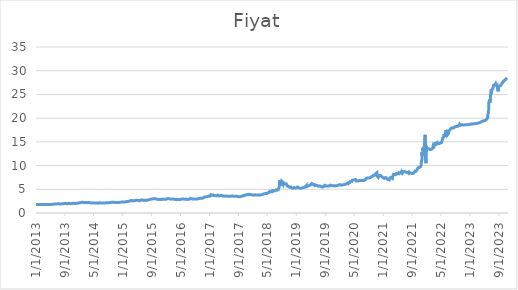
| Category | Fiyat |
|---|---|
| 1/1/13 | 1.784 |
| 1/2/13 | 1.784 |
| 1/3/13 | 1.779 |
| 1/4/13 | 1.785 |
| 1/7/13 | 1.783 |
| 1/8/13 | 1.78 |
| 1/9/13 | 1.78 |
| 1/10/13 | 1.775 |
| 1/11/13 | 1.766 |
| 1/14/13 | 1.771 |
| 1/15/13 | 1.769 |
| 1/16/13 | 1.77 |
| 1/17/13 | 1.765 |
| 1/18/13 | 1.752 |
| 1/21/13 | 1.763 |
| 1/22/13 | 1.764 |
| 1/23/13 | 1.769 |
| 1/24/13 | 1.772 |
| 1/25/13 | 1.769 |
| 1/28/13 | 1.765 |
| 1/29/13 | 1.774 |
| 1/30/13 | 1.768 |
| 1/31/13 | 1.768 |
| 2/1/13 | 1.759 |
| 2/4/13 | 1.749 |
| 2/5/13 | 1.761 |
| 2/6/13 | 1.76 |
| 2/7/13 | 1.769 |
| 2/8/13 | 1.775 |
| 2/11/13 | 1.771 |
| 2/12/13 | 1.776 |
| 2/13/13 | 1.772 |
| 2/14/13 | 1.762 |
| 2/15/13 | 1.768 |
| 2/18/13 | 1.766 |
| 2/19/13 | 1.767 |
| 2/20/13 | 1.777 |
| 2/21/13 | 1.784 |
| 2/22/13 | 1.793 |
| 2/25/13 | 1.8 |
| 2/26/13 | 1.809 |
| 2/27/13 | 1.805 |
| 2/28/13 | 1.796 |
| 3/1/13 | 1.798 |
| 3/4/13 | 1.799 |
| 3/5/13 | 1.799 |
| 3/6/13 | 1.792 |
| 3/7/13 | 1.798 |
| 3/8/13 | 1.797 |
| 3/11/13 | 1.808 |
| 3/12/13 | 1.799 |
| 3/13/13 | 1.803 |
| 3/14/13 | 1.813 |
| 3/15/13 | 1.81 |
| 3/18/13 | 1.808 |
| 3/19/13 | 1.813 |
| 3/20/13 | 1.828 |
| 3/21/13 | 1.818 |
| 3/22/13 | 1.816 |
| 3/25/13 | 1.811 |
| 3/26/13 | 1.824 |
| 3/27/13 | 1.815 |
| 3/28/13 | 1.813 |
| 3/29/13 | 1.811 |
| 4/1/13 | 1.81 |
| 4/2/13 | 1.806 |
| 4/3/13 | 1.805 |
| 4/4/13 | 1.809 |
| 4/5/13 | 1.803 |
| 4/8/13 | 1.796 |
| 4/9/13 | 1.785 |
| 4/10/13 | 1.785 |
| 4/11/13 | 1.79 |
| 4/12/13 | 1.784 |
| 4/15/13 | 1.789 |
| 4/16/13 | 1.792 |
| 4/17/13 | 1.788 |
| 4/18/13 | 1.801 |
| 4/19/13 | 1.798 |
| 4/22/13 | 1.802 |
| 4/23/13 | 1.804 |
| 4/24/13 | 1.805 |
| 4/25/13 | 1.803 |
| 4/26/13 | 1.798 |
| 4/29/13 | 1.798 |
| 4/30/13 | 1.796 |
| 5/1/13 | 1.794 |
| 5/2/13 | 1.793 |
| 5/3/13 | 1.792 |
| 5/6/13 | 1.798 |
| 5/7/13 | 1.796 |
| 5/8/13 | 1.796 |
| 5/9/13 | 1.792 |
| 5/10/13 | 1.799 |
| 5/13/13 | 1.801 |
| 5/14/13 | 1.813 |
| 5/15/13 | 1.817 |
| 5/16/13 | 1.823 |
| 5/17/13 | 1.823 |
| 5/20/13 | 1.843 |
| 5/21/13 | 1.841 |
| 5/22/13 | 1.843 |
| 5/23/13 | 1.848 |
| 5/24/13 | 1.845 |
| 5/27/13 | 1.85 |
| 5/28/13 | 1.846 |
| 5/29/13 | 1.86 |
| 5/30/13 | 1.86 |
| 5/31/13 | 1.872 |
| 6/3/13 | 1.879 |
| 6/4/13 | 1.885 |
| 6/5/13 | 1.878 |
| 6/6/13 | 1.892 |
| 6/7/13 | 1.894 |
| 6/10/13 | 1.877 |
| 6/11/13 | 1.902 |
| 6/12/13 | 1.892 |
| 6/13/13 | 1.875 |
| 6/14/13 | 1.862 |
| 6/17/13 | 1.858 |
| 6/18/13 | 1.873 |
| 6/19/13 | 1.886 |
| 6/20/13 | 1.903 |
| 6/21/13 | 1.938 |
| 6/24/13 | 1.938 |
| 6/25/13 | 1.944 |
| 6/26/13 | 1.931 |
| 6/27/13 | 1.935 |
| 6/28/13 | 1.922 |
| 7/1/13 | 1.93 |
| 7/2/13 | 1.923 |
| 7/3/13 | 1.934 |
| 7/4/13 | 1.946 |
| 7/5/13 | 1.942 |
| 7/8/13 | 1.968 |
| 7/9/13 | 1.946 |
| 7/10/13 | 1.94 |
| 7/11/13 | 1.95 |
| 7/12/13 | 1.951 |
| 7/15/13 | 1.956 |
| 7/16/13 | 1.934 |
| 7/17/13 | 1.92 |
| 7/18/13 | 1.91 |
| 7/19/13 | 1.921 |
| 7/22/13 | 1.919 |
| 7/23/13 | 1.913 |
| 7/24/13 | 1.9 |
| 7/25/13 | 1.92 |
| 7/26/13 | 1.922 |
| 7/29/13 | 1.927 |
| 7/30/13 | 1.926 |
| 7/31/13 | 1.923 |
| 8/1/13 | 1.934 |
| 8/2/13 | 1.946 |
| 8/5/13 | 1.924 |
| 8/6/13 | 1.93 |
| 8/7/13 | 1.924 |
| 8/8/13 | 1.932 |
| 8/9/13 | 1.922 |
| 8/12/13 | 1.922 |
| 8/13/13 | 1.925 |
| 8/14/13 | 1.934 |
| 8/15/13 | 1.937 |
| 8/16/13 | 1.934 |
| 8/19/13 | 1.945 |
| 8/20/13 | 1.954 |
| 8/21/13 | 1.95 |
| 8/22/13 | 1.978 |
| 8/23/13 | 1.994 |
| 8/26/13 | 1.988 |
| 8/27/13 | 1.999 |
| 8/28/13 | 2.037 |
| 8/29/13 | 2.04 |
| 8/30/13 | 2.037 |
| 9/2/13 | 2.036 |
| 9/3/13 | 2.023 |
| 9/4/13 | 2.06 |
| 9/5/13 | 2.05 |
| 9/6/13 | 2.07 |
| 9/9/13 | 2.046 |
| 9/10/13 | 2.026 |
| 9/11/13 | 2.014 |
| 9/12/13 | 2.012 |
| 9/13/13 | 2.031 |
| 9/16/13 | 2.028 |
| 9/17/13 | 2.006 |
| 9/18/13 | 2.002 |
| 9/19/13 | 1.951 |
| 9/20/13 | 1.962 |
| 9/23/13 | 1.978 |
| 9/24/13 | 1.985 |
| 9/25/13 | 1.997 |
| 9/26/13 | 2.018 |
| 9/27/13 | 2.023 |
| 9/30/13 | 2.042 |
| 10/1/13 | 2.02 |
| 10/2/13 | 2.008 |
| 10/3/13 | 1.995 |
| 10/4/13 | 2.003 |
| 10/7/13 | 1.988 |
| 10/8/13 | 1.994 |
| 10/9/13 | 1.991 |
| 10/10/13 | 1.983 |
| 10/11/13 | 1.977 |
| 10/14/13 | 1.984 |
| 10/15/13 | 1.983 |
| 10/16/13 | 1.988 |
| 10/17/13 | 1.974 |
| 10/18/13 | 1.967 |
| 10/21/13 | 1.968 |
| 10/22/13 | 1.982 |
| 10/23/13 | 1.968 |
| 10/24/13 | 1.974 |
| 10/25/13 | 1.98 |
| 10/28/13 | 1.984 |
| 10/29/13 | 1.985 |
| 10/30/13 | 1.993 |
| 10/31/13 | 1.994 |
| 11/1/13 | 1.997 |
| 11/4/13 | 2.014 |
| 11/5/13 | 2.018 |
| 11/6/13 | 2.032 |
| 11/7/13 | 2.036 |
| 11/8/13 | 2.034 |
| 11/11/13 | 2.039 |
| 11/12/13 | 2.045 |
| 11/13/13 | 2.055 |
| 11/14/13 | 2.044 |
| 11/15/13 | 2.033 |
| 11/18/13 | 2.032 |
| 11/19/13 | 2.022 |
| 11/20/13 | 2.011 |
| 11/21/13 | 2.015 |
| 11/22/13 | 2.017 |
| 11/25/13 | 2.005 |
| 11/26/13 | 2.01 |
| 11/27/13 | 2.014 |
| 11/28/13 | 2.028 |
| 11/29/13 | 2.015 |
| 12/2/13 | 2.021 |
| 12/3/13 | 2.04 |
| 12/4/13 | 2.044 |
| 12/5/13 | 2.049 |
| 12/6/13 | 2.039 |
| 12/9/13 | 2.025 |
| 12/10/13 | 2.032 |
| 12/11/13 | 2.03 |
| 12/12/13 | 2.043 |
| 12/13/13 | 2.044 |
| 12/16/13 | 2.043 |
| 12/17/13 | 2.028 |
| 12/18/13 | 2.038 |
| 12/19/13 | 2.059 |
| 12/20/13 | 2.074 |
| 12/23/13 | 2.09 |
| 12/24/13 | 2.099 |
| 12/25/13 | 2.079 |
| 12/26/13 | 2.096 |
| 12/27/13 | 2.129 |
| 12/30/13 | 2.15 |
| 12/31/13 | 2.124 |
| 1/1/14 | 2.145 |
| 1/2/14 | 2.148 |
| 1/3/14 | 2.171 |
| 1/6/14 | 2.176 |
| 1/7/14 | 2.173 |
| 1/8/14 | 2.169 |
| 1/9/14 | 2.186 |
| 1/10/14 | 2.178 |
| 1/13/14 | 2.164 |
| 1/14/14 | 2.179 |
| 1/15/14 | 2.186 |
| 1/16/14 | 2.192 |
| 1/17/14 | 2.21 |
| 1/20/14 | 2.233 |
| 1/21/14 | 2.241 |
| 1/22/14 | 2.252 |
| 1/23/14 | 2.259 |
| 1/24/14 | 2.293 |
| 1/27/14 | 2.333 |
| 1/28/14 | 2.285 |
| 1/29/14 | 2.25 |
| 1/30/14 | 2.262 |
| 1/31/14 | 2.266 |
| 2/3/14 | 2.254 |
| 2/4/14 | 2.283 |
| 2/5/14 | 2.237 |
| 2/6/14 | 2.238 |
| 2/7/14 | 2.213 |
| 2/10/14 | 2.225 |
| 2/11/14 | 2.217 |
| 2/12/14 | 2.193 |
| 2/13/14 | 2.193 |
| 2/14/14 | 2.184 |
| 2/17/14 | 2.184 |
| 2/18/14 | 2.181 |
| 2/19/14 | 2.181 |
| 2/20/14 | 2.214 |
| 2/21/14 | 2.203 |
| 2/24/14 | 2.181 |
| 2/25/14 | 2.206 |
| 2/26/14 | 2.213 |
| 2/27/14 | 2.226 |
| 2/28/14 | 2.213 |
| 3/3/14 | 2.202 |
| 3/4/14 | 2.232 |
| 3/5/14 | 2.206 |
| 3/6/14 | 2.204 |
| 3/7/14 | 2.18 |
| 3/10/14 | 2.204 |
| 3/11/14 | 2.219 |
| 3/12/14 | 2.252 |
| 3/13/14 | 2.233 |
| 3/14/14 | 2.234 |
| 3/17/14 | 2.22 |
| 3/18/14 | 2.224 |
| 3/19/14 | 2.219 |
| 3/20/14 | 2.242 |
| 3/21/14 | 2.23 |
| 3/24/14 | 2.237 |
| 3/25/14 | 2.242 |
| 3/26/14 | 2.222 |
| 3/27/14 | 2.195 |
| 3/28/14 | 2.188 |
| 3/31/14 | 2.189 |
| 4/1/14 | 2.14 |
| 4/2/14 | 2.139 |
| 4/3/14 | 2.131 |
| 4/4/14 | 2.134 |
| 4/7/14 | 2.114 |
| 4/8/14 | 2.11 |
| 4/9/14 | 2.097 |
| 4/10/14 | 2.103 |
| 4/11/14 | 2.109 |
| 4/14/14 | 2.12 |
| 4/15/14 | 2.117 |
| 4/16/14 | 2.146 |
| 4/17/14 | 2.137 |
| 4/18/14 | 2.129 |
| 4/21/14 | 2.13 |
| 4/22/14 | 2.134 |
| 4/23/14 | 2.142 |
| 4/24/14 | 2.15 |
| 4/25/14 | 2.136 |
| 4/28/14 | 2.139 |
| 4/29/14 | 2.126 |
| 4/30/14 | 2.121 |
| 5/1/14 | 2.112 |
| 5/2/14 | 2.106 |
| 5/5/14 | 2.108 |
| 5/6/14 | 2.1 |
| 5/7/14 | 2.09 |
| 5/8/14 | 2.082 |
| 5/9/14 | 2.073 |
| 5/12/14 | 2.076 |
| 5/13/14 | 2.081 |
| 5/14/14 | 2.068 |
| 5/15/14 | 2.069 |
| 5/16/14 | 2.098 |
| 5/19/14 | 2.096 |
| 5/20/14 | 2.097 |
| 5/21/14 | 2.114 |
| 5/22/14 | 2.093 |
| 5/23/14 | 2.082 |
| 5/26/14 | 2.081 |
| 5/27/14 | 2.084 |
| 5/28/14 | 2.103 |
| 5/29/14 | 2.1 |
| 5/30/14 | 2.087 |
| 6/2/14 | 2.097 |
| 6/3/14 | 2.107 |
| 6/4/14 | 2.117 |
| 6/5/14 | 2.116 |
| 6/6/14 | 2.096 |
| 6/9/14 | 2.077 |
| 6/10/14 | 2.086 |
| 6/11/14 | 2.079 |
| 6/12/14 | 2.114 |
| 6/13/14 | 2.112 |
| 6/16/14 | 2.126 |
| 6/17/14 | 2.142 |
| 6/18/14 | 2.15 |
| 6/19/14 | 2.126 |
| 6/20/14 | 2.142 |
| 6/23/14 | 2.139 |
| 6/24/14 | 2.137 |
| 6/25/14 | 2.143 |
| 6/26/14 | 2.132 |
| 6/27/14 | 2.126 |
| 6/30/14 | 2.124 |
| 7/1/14 | 2.119 |
| 7/2/14 | 2.128 |
| 7/3/14 | 2.131 |
| 7/4/14 | 2.128 |
| 7/7/14 | 2.13 |
| 7/8/14 | 2.129 |
| 7/9/14 | 2.125 |
| 7/10/14 | 2.115 |
| 7/11/14 | 2.124 |
| 7/14/14 | 2.118 |
| 7/15/14 | 2.117 |
| 7/16/14 | 2.124 |
| 7/17/14 | 2.119 |
| 7/18/14 | 2.141 |
| 7/21/14 | 2.122 |
| 7/22/14 | 2.12 |
| 7/23/14 | 2.108 |
| 7/24/14 | 2.088 |
| 7/25/14 | 2.095 |
| 7/28/14 | 2.091 |
| 7/29/14 | 2.099 |
| 7/30/14 | 2.116 |
| 7/31/14 | 2.133 |
| 8/1/14 | 2.143 |
| 8/4/14 | 2.131 |
| 8/5/14 | 2.131 |
| 8/6/14 | 2.153 |
| 8/7/14 | 2.159 |
| 8/8/14 | 2.166 |
| 8/11/14 | 2.144 |
| 8/12/14 | 2.151 |
| 8/13/14 | 2.165 |
| 8/14/14 | 2.157 |
| 8/15/14 | 2.152 |
| 8/18/14 | 2.162 |
| 8/19/14 | 2.165 |
| 8/20/14 | 2.161 |
| 8/21/14 | 2.186 |
| 8/22/14 | 2.177 |
| 8/25/14 | 2.18 |
| 8/26/14 | 2.179 |
| 8/27/14 | 2.165 |
| 8/28/14 | 2.154 |
| 8/29/14 | 2.158 |
| 9/1/14 | 2.16 |
| 9/2/14 | 2.16 |
| 9/3/14 | 2.172 |
| 9/4/14 | 2.157 |
| 9/5/14 | 2.164 |
| 9/8/14 | 2.158 |
| 9/9/14 | 2.173 |
| 9/10/14 | 2.197 |
| 9/11/14 | 2.193 |
| 9/12/14 | 2.201 |
| 9/15/14 | 2.22 |
| 9/16/14 | 2.212 |
| 9/17/14 | 2.204 |
| 9/18/14 | 2.225 |
| 9/19/14 | 2.225 |
| 9/22/14 | 2.233 |
| 9/23/14 | 2.241 |
| 9/24/14 | 2.24 |
| 9/25/14 | 2.236 |
| 9/26/14 | 2.261 |
| 9/29/14 | 2.262 |
| 9/30/14 | 2.28 |
| 10/1/14 | 2.278 |
| 10/2/14 | 2.283 |
| 10/3/14 | 2.267 |
| 10/6/14 | 2.292 |
| 10/7/14 | 2.268 |
| 10/8/14 | 2.276 |
| 10/9/14 | 2.261 |
| 10/10/14 | 2.27 |
| 10/13/14 | 2.287 |
| 10/14/14 | 2.27 |
| 10/15/14 | 2.273 |
| 10/16/14 | 2.27 |
| 10/17/14 | 2.263 |
| 10/20/14 | 2.245 |
| 10/21/14 | 2.244 |
| 10/22/14 | 2.246 |
| 10/23/14 | 2.247 |
| 10/24/14 | 2.236 |
| 10/27/14 | 2.228 |
| 10/28/14 | 2.23 |
| 10/29/14 | 2.207 |
| 10/30/14 | 2.215 |
| 10/31/14 | 2.2 |
| 11/3/14 | 2.219 |
| 11/4/14 | 2.235 |
| 11/5/14 | 2.221 |
| 11/6/14 | 2.244 |
| 11/7/14 | 2.264 |
| 11/10/14 | 2.257 |
| 11/11/14 | 2.26 |
| 11/12/14 | 2.257 |
| 11/13/14 | 2.253 |
| 11/14/14 | 2.242 |
| 11/17/14 | 2.229 |
| 11/18/14 | 2.231 |
| 11/19/14 | 2.222 |
| 11/20/14 | 2.232 |
| 11/21/14 | 2.219 |
| 11/24/14 | 2.221 |
| 11/25/14 | 2.23 |
| 11/26/14 | 2.219 |
| 11/27/14 | 2.211 |
| 11/28/14 | 2.207 |
| 12/1/14 | 2.223 |
| 12/2/14 | 2.215 |
| 12/3/14 | 2.233 |
| 12/4/14 | 2.24 |
| 12/5/14 | 2.235 |
| 12/8/14 | 2.265 |
| 12/9/14 | 2.269 |
| 12/10/14 | 2.267 |
| 12/11/14 | 2.267 |
| 12/12/14 | 2.278 |
| 12/15/14 | 2.298 |
| 12/16/14 | 2.377 |
| 12/17/14 | 2.36 |
| 12/18/14 | 2.339 |
| 12/19/14 | 2.322 |
| 12/22/14 | 2.309 |
| 12/23/14 | 2.315 |
| 12/24/14 | 2.322 |
| 12/25/14 | 2.318 |
| 12/26/14 | 2.32 |
| 12/29/14 | 2.317 |
| 12/30/14 | 2.318 |
| 12/31/14 | 2.329 |
| 1/1/15 | 2.336 |
| 1/2/15 | 2.332 |
| 1/5/15 | 2.352 |
| 1/6/15 | 2.331 |
| 1/7/15 | 2.323 |
| 1/8/15 | 2.319 |
| 1/9/15 | 2.299 |
| 1/12/15 | 2.29 |
| 1/13/15 | 2.285 |
| 1/14/15 | 2.285 |
| 1/15/15 | 2.282 |
| 1/16/15 | 2.313 |
| 1/19/15 | 2.332 |
| 1/20/15 | 2.337 |
| 1/21/15 | 2.346 |
| 1/22/15 | 2.352 |
| 1/23/15 | 2.322 |
| 1/26/15 | 2.364 |
| 1/27/15 | 2.355 |
| 1/28/15 | 2.364 |
| 1/29/15 | 2.384 |
| 1/30/15 | 2.416 |
| 2/2/15 | 2.445 |
| 2/3/15 | 2.431 |
| 2/4/15 | 2.401 |
| 2/5/15 | 2.466 |
| 2/6/15 | 2.438 |
| 2/9/15 | 2.48 |
| 2/10/15 | 2.476 |
| 2/11/15 | 2.496 |
| 2/12/15 | 2.5 |
| 2/13/15 | 2.467 |
| 2/16/15 | 2.458 |
| 2/17/15 | 2.456 |
| 2/18/15 | 2.452 |
| 2/19/15 | 2.443 |
| 2/20/15 | 2.454 |
| 2/23/15 | 2.469 |
| 2/24/15 | 2.477 |
| 2/25/15 | 2.463 |
| 2/26/15 | 2.488 |
| 2/27/15 | 2.506 |
| 3/2/15 | 2.512 |
| 3/3/15 | 2.519 |
| 3/4/15 | 2.538 |
| 3/5/15 | 2.564 |
| 3/6/15 | 2.608 |
| 3/9/15 | 2.627 |
| 3/10/15 | 2.601 |
| 3/11/15 | 2.638 |
| 3/12/15 | 2.61 |
| 3/13/15 | 2.585 |
| 3/16/15 | 2.631 |
| 3/17/15 | 2.626 |
| 3/18/15 | 2.612 |
| 3/19/15 | 2.57 |
| 3/20/15 | 2.604 |
| 3/23/15 | 2.575 |
| 3/24/15 | 2.542 |
| 3/25/15 | 2.552 |
| 3/26/15 | 2.587 |
| 3/27/15 | 2.592 |
| 3/30/15 | 2.611 |
| 3/31/15 | 2.61 |
| 4/1/15 | 2.598 |
| 4/2/15 | 2.6 |
| 4/3/15 | 2.586 |
| 4/6/15 | 2.569 |
| 4/7/15 | 2.574 |
| 4/8/15 | 2.602 |
| 4/9/15 | 2.598 |
| 4/10/15 | 2.62 |
| 4/13/15 | 2.62 |
| 4/14/15 | 2.67 |
| 4/15/15 | 2.688 |
| 4/16/15 | 2.698 |
| 4/17/15 | 2.678 |
| 4/20/15 | 2.688 |
| 4/21/15 | 2.7 |
| 4/22/15 | 2.685 |
| 4/23/15 | 2.712 |
| 4/24/15 | 2.701 |
| 4/27/15 | 2.725 |
| 4/28/15 | 2.675 |
| 4/29/15 | 2.658 |
| 4/30/15 | 2.66 |
| 5/1/15 | 2.672 |
| 5/4/15 | 2.714 |
| 5/5/15 | 2.711 |
| 5/6/15 | 2.704 |
| 5/7/15 | 2.693 |
| 5/8/15 | 2.686 |
| 5/11/15 | 2.689 |
| 5/12/15 | 2.694 |
| 5/13/15 | 2.663 |
| 5/14/15 | 2.631 |
| 5/15/15 | 2.591 |
| 5/18/15 | 2.576 |
| 5/19/15 | 2.581 |
| 5/20/15 | 2.593 |
| 5/21/15 | 2.577 |
| 5/22/15 | 2.589 |
| 5/25/15 | 2.6 |
| 5/26/15 | 2.614 |
| 5/27/15 | 2.641 |
| 5/28/15 | 2.642 |
| 5/29/15 | 2.655 |
| 6/1/15 | 2.662 |
| 6/2/15 | 2.683 |
| 6/3/15 | 2.674 |
| 6/4/15 | 2.685 |
| 6/5/15 | 2.667 |
| 6/8/15 | 2.771 |
| 6/9/15 | 2.752 |
| 6/10/15 | 2.752 |
| 6/11/15 | 2.735 |
| 6/12/15 | 2.703 |
| 6/15/15 | 2.712 |
| 6/16/15 | 2.737 |
| 6/17/15 | 2.734 |
| 6/18/15 | 2.705 |
| 6/19/15 | 2.714 |
| 6/22/15 | 2.695 |
| 6/23/15 | 2.666 |
| 6/24/15 | 2.679 |
| 6/25/15 | 2.678 |
| 6/26/15 | 2.655 |
| 6/29/15 | 2.667 |
| 6/30/15 | 2.702 |
| 7/1/15 | 2.682 |
| 7/2/15 | 2.691 |
| 7/3/15 | 2.685 |
| 7/6/15 | 2.692 |
| 7/7/15 | 2.678 |
| 7/8/15 | 2.686 |
| 7/9/15 | 2.688 |
| 7/10/15 | 2.678 |
| 7/13/15 | 2.672 |
| 7/14/15 | 2.646 |
| 7/15/15 | 2.632 |
| 7/16/15 | 2.645 |
| 7/17/15 | 2.656 |
| 7/20/15 | 2.653 |
| 7/21/15 | 2.698 |
| 7/22/15 | 2.686 |
| 7/23/15 | 2.708 |
| 7/24/15 | 2.735 |
| 7/27/15 | 2.741 |
| 7/28/15 | 2.771 |
| 7/29/15 | 2.759 |
| 7/30/15 | 2.766 |
| 7/31/15 | 2.783 |
| 8/3/15 | 2.767 |
| 8/4/15 | 2.781 |
| 8/5/15 | 2.783 |
| 8/6/15 | 2.787 |
| 8/7/15 | 2.776 |
| 8/10/15 | 2.781 |
| 8/11/15 | 2.779 |
| 8/12/15 | 2.78 |
| 8/13/15 | 2.777 |
| 8/14/15 | 2.822 |
| 8/17/15 | 2.836 |
| 8/18/15 | 2.87 |
| 8/19/15 | 2.894 |
| 8/20/15 | 2.926 |
| 8/21/15 | 2.916 |
| 8/24/15 | 2.92 |
| 8/25/15 | 2.942 |
| 8/26/15 | 2.94 |
| 8/27/15 | 2.932 |
| 8/28/15 | 2.909 |
| 8/31/15 | 2.926 |
| 9/1/15 | 2.914 |
| 9/2/15 | 2.93 |
| 9/3/15 | 2.942 |
| 9/4/15 | 2.971 |
| 9/7/15 | 2.999 |
| 9/8/15 | 3.032 |
| 9/9/15 | 3.011 |
| 9/10/15 | 3.038 |
| 9/11/15 | 3.022 |
| 9/14/15 | 3.036 |
| 9/15/15 | 3.059 |
| 9/16/15 | 3.03 |
| 9/17/15 | 2.999 |
| 9/18/15 | 3.012 |
| 9/21/15 | 3.008 |
| 9/22/15 | 3.006 |
| 9/23/15 | 3.025 |
| 9/24/15 | 3.039 |
| 9/25/15 | 3.038 |
| 9/28/15 | 3.047 |
| 9/29/15 | 3.056 |
| 9/30/15 | 3.037 |
| 10/1/15 | 3.025 |
| 10/2/15 | 3.027 |
| 10/5/15 | 2.995 |
| 10/6/15 | 2.982 |
| 10/7/15 | 2.958 |
| 10/8/15 | 2.94 |
| 10/9/15 | 2.894 |
| 10/12/15 | 2.917 |
| 10/13/15 | 2.926 |
| 10/14/15 | 2.958 |
| 10/15/15 | 2.914 |
| 10/16/15 | 2.88 |
| 10/19/15 | 2.894 |
| 10/20/15 | 2.906 |
| 10/21/15 | 2.9 |
| 10/22/15 | 2.895 |
| 10/23/15 | 2.873 |
| 10/26/15 | 2.907 |
| 10/27/15 | 2.89 |
| 10/28/15 | 2.904 |
| 10/29/15 | 2.924 |
| 10/30/15 | 2.938 |
| 11/2/15 | 2.915 |
| 11/3/15 | 2.824 |
| 11/4/15 | 2.828 |
| 11/5/15 | 2.863 |
| 11/6/15 | 2.862 |
| 11/9/15 | 2.914 |
| 11/10/15 | 2.923 |
| 11/11/15 | 2.915 |
| 11/12/15 | 2.874 |
| 11/13/15 | 2.865 |
| 11/16/15 | 2.865 |
| 11/17/15 | 2.883 |
| 11/18/15 | 2.869 |
| 11/19/15 | 2.863 |
| 11/20/15 | 2.844 |
| 11/23/15 | 2.829 |
| 11/24/15 | 2.851 |
| 11/25/15 | 2.877 |
| 11/26/15 | 2.889 |
| 11/27/15 | 2.922 |
| 11/30/15 | 2.921 |
| 12/1/15 | 2.914 |
| 12/2/15 | 2.891 |
| 12/3/15 | 2.89 |
| 12/4/15 | 2.886 |
| 12/7/15 | 2.894 |
| 12/8/15 | 2.913 |
| 12/9/15 | 2.91 |
| 12/10/15 | 2.916 |
| 12/11/15 | 2.925 |
| 12/14/15 | 2.975 |
| 12/15/15 | 2.98 |
| 12/16/15 | 2.965 |
| 12/17/15 | 2.937 |
| 12/18/15 | 2.932 |
| 12/21/15 | 2.908 |
| 12/22/15 | 2.915 |
| 12/23/15 | 2.929 |
| 12/24/15 | 2.916 |
| 12/25/15 | 2.92 |
| 12/28/15 | 2.919 |
| 12/29/15 | 2.906 |
| 12/30/15 | 2.907 |
| 12/31/15 | 2.916 |
| 1/1/16 | 2.918 |
| 1/4/16 | 2.918 |
| 1/5/16 | 2.964 |
| 1/6/16 | 2.985 |
| 1/7/16 | 3.001 |
| 1/8/16 | 2.999 |
| 1/11/16 | 3.021 |
| 1/12/16 | 3.038 |
| 1/13/16 | 3.034 |
| 1/14/16 | 3.026 |
| 1/15/16 | 3.023 |
| 1/18/16 | 3.049 |
| 1/19/16 | 3.034 |
| 1/20/16 | 3.04 |
| 1/21/16 | 3.042 |
| 1/22/16 | 3.014 |
| 1/25/16 | 3.001 |
| 1/26/16 | 3.021 |
| 1/27/16 | 3.008 |
| 1/28/16 | 3.001 |
| 1/29/16 | 2.969 |
| 2/1/16 | 2.956 |
| 2/2/16 | 2.946 |
| 2/3/16 | 2.952 |
| 2/4/16 | 2.916 |
| 2/5/16 | 2.914 |
| 2/8/16 | 2.918 |
| 2/9/16 | 2.948 |
| 2/10/16 | 2.94 |
| 2/11/16 | 2.922 |
| 2/12/16 | 2.931 |
| 2/15/16 | 2.93 |
| 2/16/16 | 2.947 |
| 2/17/16 | 2.975 |
| 2/18/16 | 2.958 |
| 2/19/16 | 2.968 |
| 2/22/16 | 2.953 |
| 2/23/16 | 2.937 |
| 2/24/16 | 2.944 |
| 2/25/16 | 2.936 |
| 2/26/16 | 2.93 |
| 2/29/16 | 2.996 |
| 3/1/16 | 2.966 |
| 3/2/16 | 2.936 |
| 3/3/16 | 2.927 |
| 3/4/16 | 2.91 |
| 3/7/16 | 2.909 |
| 3/8/16 | 2.915 |
| 3/9/16 | 2.916 |
| 3/10/16 | 2.892 |
| 3/11/16 | 2.892 |
| 3/14/16 | 2.868 |
| 3/15/16 | 2.871 |
| 3/16/16 | 2.898 |
| 3/17/16 | 2.868 |
| 3/18/16 | 2.84 |
| 3/21/16 | 2.864 |
| 3/22/16 | 2.863 |
| 3/23/16 | 2.867 |
| 3/24/16 | 2.876 |
| 3/25/16 | 2.872 |
| 3/28/16 | 2.872 |
| 3/29/16 | 2.868 |
| 3/30/16 | 2.837 |
| 3/31/16 | 2.835 |
| 4/1/16 | 2.816 |
| 4/4/16 | 2.825 |
| 4/5/16 | 2.812 |
| 4/6/16 | 2.832 |
| 4/7/16 | 2.841 |
| 4/8/16 | 2.861 |
| 4/11/16 | 2.849 |
| 4/12/16 | 2.833 |
| 4/13/16 | 2.835 |
| 4/14/16 | 2.846 |
| 4/15/16 | 2.85 |
| 4/18/16 | 2.852 |
| 4/19/16 | 2.839 |
| 4/20/16 | 2.833 |
| 4/21/16 | 2.815 |
| 4/22/16 | 2.832 |
| 4/25/16 | 2.844 |
| 4/26/16 | 2.844 |
| 4/27/16 | 2.82 |
| 4/28/16 | 2.818 |
| 4/29/16 | 2.812 |
| 5/2/16 | 2.795 |
| 5/3/16 | 2.805 |
| 5/4/16 | 2.851 |
| 5/5/16 | 2.962 |
| 5/6/16 | 2.923 |
| 5/9/16 | 2.928 |
| 5/10/16 | 2.944 |
| 5/11/16 | 2.95 |
| 5/12/16 | 2.954 |
| 5/13/16 | 2.96 |
| 5/16/16 | 2.967 |
| 5/17/16 | 2.976 |
| 5/18/16 | 2.963 |
| 5/19/16 | 2.99 |
| 5/20/16 | 2.985 |
| 5/23/16 | 2.977 |
| 5/24/16 | 2.996 |
| 5/25/16 | 2.944 |
| 5/26/16 | 2.937 |
| 5/27/16 | 2.934 |
| 5/30/16 | 2.958 |
| 5/31/16 | 2.955 |
| 6/1/16 | 2.95 |
| 6/2/16 | 2.942 |
| 6/3/16 | 2.949 |
| 6/6/16 | 2.911 |
| 6/7/16 | 2.904 |
| 6/8/16 | 2.897 |
| 6/9/16 | 2.891 |
| 6/10/16 | 2.892 |
| 6/13/16 | 2.929 |
| 6/14/16 | 2.92 |
| 6/15/16 | 2.937 |
| 6/16/16 | 2.925 |
| 6/17/16 | 2.932 |
| 6/20/16 | 2.932 |
| 6/21/16 | 2.906 |
| 6/22/16 | 2.911 |
| 6/23/16 | 2.896 |
| 6/24/16 | 2.852 |
| 6/27/16 | 2.928 |
| 6/28/16 | 2.939 |
| 6/29/16 | 2.904 |
| 6/30/16 | 2.892 |
| 7/1/16 | 2.877 |
| 7/4/16 | 2.903 |
| 7/5/16 | 2.907 |
| 7/6/16 | 2.93 |
| 7/7/16 | 2.937 |
| 7/8/16 | 2.938 |
| 7/11/16 | 2.891 |
| 7/12/16 | 2.904 |
| 7/13/16 | 2.885 |
| 7/14/16 | 2.899 |
| 7/15/16 | 2.877 |
| 7/18/16 | 3.02 |
| 7/19/16 | 2.98 |
| 7/20/16 | 3.044 |
| 7/21/16 | 3.089 |
| 7/22/16 | 3.072 |
| 7/25/16 | 3.066 |
| 7/26/16 | 3.038 |
| 7/27/16 | 3.045 |
| 7/28/16 | 3.018 |
| 7/29/16 | 3.012 |
| 8/1/16 | 2.994 |
| 8/2/16 | 2.991 |
| 8/3/16 | 2.993 |
| 8/4/16 | 3.013 |
| 8/5/16 | 3.011 |
| 8/8/16 | 3.002 |
| 8/9/16 | 2.982 |
| 8/10/16 | 2.968 |
| 8/11/16 | 2.957 |
| 8/12/16 | 2.957 |
| 8/15/16 | 2.957 |
| 8/16/16 | 2.94 |
| 8/17/16 | 2.929 |
| 8/18/16 | 2.922 |
| 8/19/16 | 2.927 |
| 8/22/16 | 2.93 |
| 8/23/16 | 2.943 |
| 8/24/16 | 2.952 |
| 8/25/16 | 2.952 |
| 8/26/16 | 2.934 |
| 8/29/16 | 2.957 |
| 8/30/16 | 2.95 |
| 8/31/16 | 2.963 |
| 9/1/16 | 2.958 |
| 9/2/16 | 2.961 |
| 9/5/16 | 2.949 |
| 9/6/16 | 2.946 |
| 9/7/16 | 2.922 |
| 9/8/16 | 2.936 |
| 9/9/16 | 2.953 |
| 9/12/16 | 2.969 |
| 9/13/16 | 2.968 |
| 9/14/16 | 2.984 |
| 9/15/16 | 2.98 |
| 9/16/16 | 2.968 |
| 9/19/16 | 2.984 |
| 9/20/16 | 2.976 |
| 9/21/16 | 2.978 |
| 9/22/16 | 2.956 |
| 9/23/16 | 2.942 |
| 9/26/16 | 2.992 |
| 9/27/16 | 2.98 |
| 9/28/16 | 2.974 |
| 9/29/16 | 2.98 |
| 9/30/16 | 3 |
| 10/3/16 | 3.002 |
| 10/4/16 | 3.019 |
| 10/5/16 | 3.06 |
| 10/6/16 | 3.052 |
| 10/7/16 | 3.04 |
| 10/10/16 | 3.05 |
| 10/11/16 | 3.071 |
| 10/12/16 | 3.084 |
| 10/13/16 | 3.085 |
| 10/14/16 | 3.087 |
| 10/17/16 | 3.086 |
| 10/18/16 | 3.096 |
| 10/19/16 | 3.094 |
| 10/20/16 | 3.06 |
| 10/21/16 | 3.06 |
| 10/24/16 | 3.084 |
| 10/25/16 | 3.074 |
| 10/26/16 | 3.071 |
| 10/27/16 | 3.081 |
| 10/28/16 | 3.114 |
| 10/31/16 | 3.103 |
| 11/1/16 | 3.094 |
| 11/2/16 | 3.112 |
| 11/3/16 | 3.115 |
| 11/4/16 | 3.11 |
| 11/7/16 | 3.157 |
| 11/8/16 | 3.168 |
| 11/9/16 | 3.155 |
| 11/10/16 | 3.209 |
| 11/11/16 | 3.251 |
| 11/14/16 | 3.251 |
| 11/15/16 | 3.29 |
| 11/16/16 | 3.292 |
| 11/17/16 | 3.324 |
| 11/18/16 | 3.37 |
| 11/21/16 | 3.374 |
| 11/22/16 | 3.362 |
| 11/23/16 | 3.385 |
| 11/24/16 | 3.397 |
| 11/25/16 | 3.446 |
| 11/28/16 | 3.452 |
| 11/29/16 | 3.414 |
| 11/30/16 | 3.408 |
| 12/1/16 | 3.436 |
| 12/2/16 | 3.504 |
| 12/5/16 | 3.52 |
| 12/6/16 | 3.523 |
| 12/7/16 | 3.447 |
| 12/8/16 | 3.389 |
| 12/9/16 | 3.442 |
| 12/12/16 | 3.482 |
| 12/13/16 | 3.469 |
| 12/14/16 | 3.491 |
| 12/15/16 | 3.532 |
| 12/16/16 | 3.511 |
| 12/19/16 | 3.507 |
| 12/20/16 | 3.534 |
| 12/21/16 | 3.527 |
| 12/22/16 | 3.509 |
| 12/23/16 | 3.512 |
| 12/26/16 | 3.518 |
| 12/27/16 | 3.512 |
| 12/28/16 | 3.522 |
| 12/29/16 | 3.54 |
| 12/30/16 | 3.522 |
| 1/2/17 | 3.525 |
| 1/3/17 | 3.545 |
| 1/4/17 | 3.594 |
| 1/5/17 | 3.572 |
| 1/6/17 | 3.592 |
| 1/9/17 | 3.645 |
| 1/10/17 | 3.714 |
| 1/11/17 | 3.791 |
| 1/12/17 | 3.863 |
| 1/13/17 | 3.76 |
| 1/16/17 | 3.726 |
| 1/17/17 | 3.804 |
| 1/18/17 | 3.76 |
| 1/19/17 | 3.796 |
| 1/20/17 | 3.828 |
| 1/23/17 | 3.766 |
| 1/24/17 | 3.757 |
| 1/25/17 | 3.785 |
| 1/26/17 | 3.834 |
| 1/27/17 | 3.852 |
| 1/30/17 | 3.868 |
| 1/31/17 | 3.781 |
| 2/1/17 | 3.773 |
| 2/2/17 | 3.77 |
| 2/3/17 | 3.737 |
| 2/6/17 | 3.698 |
| 2/7/17 | 3.684 |
| 2/8/17 | 3.746 |
| 2/9/17 | 3.719 |
| 2/10/17 | 3.683 |
| 2/13/17 | 3.694 |
| 2/14/17 | 3.671 |
| 2/15/17 | 3.65 |
| 2/16/17 | 3.659 |
| 2/17/17 | 3.668 |
| 2/20/17 | 3.63 |
| 2/21/17 | 3.624 |
| 2/22/17 | 3.62 |
| 2/23/17 | 3.581 |
| 2/24/17 | 3.57 |
| 2/27/17 | 3.608 |
| 2/28/17 | 3.608 |
| 3/1/17 | 3.647 |
| 3/2/17 | 3.656 |
| 3/3/17 | 3.728 |
| 3/6/17 | 3.704 |
| 3/7/17 | 3.714 |
| 3/8/17 | 3.681 |
| 3/9/17 | 3.746 |
| 3/10/17 | 3.775 |
| 3/13/17 | 3.73 |
| 3/14/17 | 3.742 |
| 3/15/17 | 3.743 |
| 3/16/17 | 3.677 |
| 3/17/17 | 3.626 |
| 3/20/17 | 3.634 |
| 3/21/17 | 3.616 |
| 3/22/17 | 3.632 |
| 3/23/17 | 3.618 |
| 3/24/17 | 3.634 |
| 3/27/17 | 3.607 |
| 3/28/17 | 3.617 |
| 3/29/17 | 3.659 |
| 3/30/17 | 3.645 |
| 3/31/17 | 3.652 |
| 4/3/17 | 3.635 |
| 4/4/17 | 3.646 |
| 4/5/17 | 3.68 |
| 4/6/17 | 3.699 |
| 4/7/17 | 3.711 |
| 4/10/17 | 3.733 |
| 4/11/17 | 3.729 |
| 4/12/17 | 3.697 |
| 4/13/17 | 3.647 |
| 4/14/17 | 3.664 |
| 4/17/17 | 3.633 |
| 4/18/17 | 3.702 |
| 4/19/17 | 3.661 |
| 4/20/17 | 3.673 |
| 4/21/17 | 3.641 |
| 4/24/17 | 3.641 |
| 4/25/17 | 3.572 |
| 4/26/17 | 3.579 |
| 4/27/17 | 3.578 |
| 4/28/17 | 3.561 |
| 5/1/17 | 3.552 |
| 5/2/17 | 3.554 |
| 5/3/17 | 3.527 |
| 5/4/17 | 3.536 |
| 5/5/17 | 3.554 |
| 5/8/17 | 3.536 |
| 5/9/17 | 3.585 |
| 5/10/17 | 3.624 |
| 5/11/17 | 3.586 |
| 5/12/17 | 3.575 |
| 5/15/17 | 3.571 |
| 5/16/17 | 3.547 |
| 5/17/17 | 3.539 |
| 5/18/17 | 3.569 |
| 5/19/17 | 3.624 |
| 5/22/17 | 3.576 |
| 5/23/17 | 3.56 |
| 5/24/17 | 3.569 |
| 5/25/17 | 3.56 |
| 5/26/17 | 3.566 |
| 5/29/17 | 3.58 |
| 5/30/17 | 3.573 |
| 5/31/17 | 3.55 |
| 6/1/17 | 3.528 |
| 6/2/17 | 3.525 |
| 6/5/17 | 3.508 |
| 6/6/17 | 3.523 |
| 6/7/17 | 3.515 |
| 6/8/17 | 3.546 |
| 6/9/17 | 3.524 |
| 6/12/17 | 3.537 |
| 6/13/17 | 3.517 |
| 6/14/17 | 3.519 |
| 6/15/17 | 3.488 |
| 6/16/17 | 3.512 |
| 6/19/17 | 3.502 |
| 6/20/17 | 3.522 |
| 6/21/17 | 3.541 |
| 6/22/17 | 3.531 |
| 6/23/17 | 3.508 |
| 6/26/17 | 3.509 |
| 6/27/17 | 3.501 |
| 6/28/17 | 3.526 |
| 6/29/17 | 3.514 |
| 6/30/17 | 3.526 |
| 7/3/17 | 3.521 |
| 7/4/17 | 3.557 |
| 7/5/17 | 3.559 |
| 7/6/17 | 3.607 |
| 7/7/17 | 3.619 |
| 7/10/17 | 3.617 |
| 7/11/17 | 3.609 |
| 7/12/17 | 3.613 |
| 7/13/17 | 3.566 |
| 7/14/17 | 3.565 |
| 7/17/17 | 3.538 |
| 7/18/17 | 3.528 |
| 7/19/17 | 3.522 |
| 7/20/17 | 3.522 |
| 7/21/17 | 3.526 |
| 7/24/17 | 3.537 |
| 7/25/17 | 3.557 |
| 7/26/17 | 3.573 |
| 7/27/17 | 3.537 |
| 7/28/17 | 3.535 |
| 7/31/17 | 3.529 |
| 8/1/17 | 3.52 |
| 8/2/17 | 3.528 |
| 8/3/17 | 3.533 |
| 8/4/17 | 3.539 |
| 8/7/17 | 3.528 |
| 8/8/17 | 3.529 |
| 8/9/17 | 3.533 |
| 8/10/17 | 3.537 |
| 8/11/17 | 3.542 |
| 8/14/17 | 3.54 |
| 8/15/17 | 3.525 |
| 8/16/17 | 3.537 |
| 8/17/17 | 3.516 |
| 8/18/17 | 3.525 |
| 8/21/17 | 3.514 |
| 8/22/17 | 3.496 |
| 8/23/17 | 3.494 |
| 8/24/17 | 3.476 |
| 8/25/17 | 3.484 |
| 8/28/17 | 3.438 |
| 8/29/17 | 3.444 |
| 8/30/17 | 3.446 |
| 8/31/17 | 3.452 |
| 9/1/17 | 3.45 |
| 9/4/17 | 3.426 |
| 9/5/17 | 3.434 |
| 9/6/17 | 3.434 |
| 9/7/17 | 3.427 |
| 9/8/17 | 3.404 |
| 9/11/17 | 3.412 |
| 9/12/17 | 3.406 |
| 9/13/17 | 3.432 |
| 9/14/17 | 3.458 |
| 9/15/17 | 3.433 |
| 9/18/17 | 3.44 |
| 9/19/17 | 3.49 |
| 9/20/17 | 3.49 |
| 9/21/17 | 3.504 |
| 9/22/17 | 3.503 |
| 9/25/17 | 3.492 |
| 9/26/17 | 3.55 |
| 9/27/17 | 3.538 |
| 9/28/17 | 3.579 |
| 9/29/17 | 3.558 |
| 10/2/17 | 3.565 |
| 10/3/17 | 3.564 |
| 10/4/17 | 3.571 |
| 10/5/17 | 3.572 |
| 10/6/17 | 3.583 |
| 10/9/17 | 3.616 |
| 10/10/17 | 3.701 |
| 10/11/17 | 3.709 |
| 10/12/17 | 3.65 |
| 10/13/17 | 3.654 |
| 10/16/17 | 3.63 |
| 10/17/17 | 3.648 |
| 10/18/17 | 3.666 |
| 10/19/17 | 3.679 |
| 10/20/17 | 3.645 |
| 10/23/17 | 3.671 |
| 10/24/17 | 3.716 |
| 10/25/17 | 3.742 |
| 10/26/17 | 3.767 |
| 10/27/17 | 3.82 |
| 10/30/17 | 3.791 |
| 10/31/17 | 3.779 |
| 11/1/17 | 3.792 |
| 11/2/17 | 3.812 |
| 11/3/17 | 3.797 |
| 11/6/17 | 3.882 |
| 11/7/17 | 3.828 |
| 11/8/17 | 3.885 |
| 11/9/17 | 3.868 |
| 11/10/17 | 3.861 |
| 11/13/17 | 3.86 |
| 11/14/17 | 3.868 |
| 11/15/17 | 3.885 |
| 11/16/17 | 3.881 |
| 11/17/17 | 3.865 |
| 11/20/17 | 3.877 |
| 11/21/17 | 3.929 |
| 11/22/17 | 3.955 |
| 11/23/17 | 3.918 |
| 11/24/17 | 3.92 |
| 11/27/17 | 3.95 |
| 11/28/17 | 3.906 |
| 11/29/17 | 3.964 |
| 11/30/17 | 3.962 |
| 12/1/17 | 3.918 |
| 12/4/17 | 3.916 |
| 12/5/17 | 3.874 |
| 12/6/17 | 3.844 |
| 12/7/17 | 3.851 |
| 12/8/17 | 3.859 |
| 12/11/17 | 3.839 |
| 12/12/17 | 3.838 |
| 12/13/17 | 3.848 |
| 12/14/17 | 3.811 |
| 12/15/17 | 3.889 |
| 12/18/17 | 3.863 |
| 12/19/17 | 3.83 |
| 12/20/17 | 3.833 |
| 12/21/17 | 3.819 |
| 12/22/17 | 3.818 |
| 12/25/17 | 3.81 |
| 12/26/17 | 3.809 |
| 12/27/17 | 3.811 |
| 12/28/17 | 3.816 |
| 12/29/17 | 3.775 |
| 1/1/18 | 3.786 |
| 1/2/18 | 3.792 |
| 1/3/18 | 3.766 |
| 1/4/18 | 3.783 |
| 1/5/18 | 3.75 |
| 1/8/18 | 3.732 |
| 1/9/18 | 3.746 |
| 1/10/18 | 3.768 |
| 1/11/18 | 3.8 |
| 1/12/18 | 3.777 |
| 1/15/18 | 3.748 |
| 1/16/18 | 3.801 |
| 1/17/18 | 3.797 |
| 1/18/18 | 3.816 |
| 1/19/18 | 3.771 |
| 1/22/18 | 3.832 |
| 1/23/18 | 3.776 |
| 1/24/18 | 3.767 |
| 1/25/18 | 3.738 |
| 1/26/18 | 3.752 |
| 1/29/18 | 3.754 |
| 1/30/18 | 3.793 |
| 1/31/18 | 3.781 |
| 2/1/18 | 3.755 |
| 2/2/18 | 3.734 |
| 2/5/18 | 3.769 |
| 2/6/18 | 3.79 |
| 2/7/18 | 3.77 |
| 2/8/18 | 3.805 |
| 2/9/18 | 3.821 |
| 2/12/18 | 3.821 |
| 2/13/18 | 3.8 |
| 2/14/18 | 3.812 |
| 2/15/18 | 3.783 |
| 2/16/18 | 3.764 |
| 2/19/18 | 3.746 |
| 2/20/18 | 3.757 |
| 2/21/18 | 3.797 |
| 2/22/18 | 3.787 |
| 2/23/18 | 3.784 |
| 2/26/18 | 3.788 |
| 2/27/18 | 3.785 |
| 2/28/18 | 3.815 |
| 3/1/18 | 3.8 |
| 3/2/18 | 3.806 |
| 3/5/18 | 3.807 |
| 3/6/18 | 3.808 |
| 3/7/18 | 3.793 |
| 3/8/18 | 3.799 |
| 3/9/18 | 3.824 |
| 3/12/18 | 3.81 |
| 3/13/18 | 3.844 |
| 3/14/18 | 3.873 |
| 3/15/18 | 3.879 |
| 3/16/18 | 3.896 |
| 3/19/18 | 3.912 |
| 3/20/18 | 3.936 |
| 3/21/18 | 3.935 |
| 3/22/18 | 3.91 |
| 3/23/18 | 3.931 |
| 3/26/18 | 3.98 |
| 3/27/18 | 3.966 |
| 3/28/18 | 3.982 |
| 3/29/18 | 4.008 |
| 3/30/18 | 3.943 |
| 4/2/18 | 3.954 |
| 4/3/18 | 3.972 |
| 4/4/18 | 3.989 |
| 4/5/18 | 3.997 |
| 4/6/18 | 4.053 |
| 4/9/18 | 4.041 |
| 4/10/18 | 4.072 |
| 4/11/18 | 4.112 |
| 4/12/18 | 4.131 |
| 4/13/18 | 4.11 |
| 4/16/18 | 4.098 |
| 4/17/18 | 4.097 |
| 4/18/18 | 4.094 |
| 4/19/18 | 4.008 |
| 4/20/18 | 4.04 |
| 4/23/18 | 4.077 |
| 4/24/18 | 4.108 |
| 4/25/18 | 4.087 |
| 4/26/18 | 4.081 |
| 4/27/18 | 4.066 |
| 4/30/18 | 4.044 |
| 5/1/18 | 4.061 |
| 5/2/18 | 4.103 |
| 5/3/18 | 4.177 |
| 5/4/18 | 4.215 |
| 5/7/18 | 4.226 |
| 5/8/18 | 4.266 |
| 5/9/18 | 4.329 |
| 5/10/18 | 4.287 |
| 5/11/18 | 4.235 |
| 5/14/18 | 4.314 |
| 5/15/18 | 4.369 |
| 5/16/18 | 4.443 |
| 5/17/18 | 4.411 |
| 5/18/18 | 4.457 |
| 5/21/18 | 4.49 |
| 5/22/18 | 4.574 |
| 5/23/18 | 4.666 |
| 5/24/18 | 4.576 |
| 5/25/18 | 4.709 |
| 5/28/18 | 4.713 |
| 5/29/18 | 4.577 |
| 5/30/18 | 4.548 |
| 5/31/18 | 4.459 |
| 6/1/18 | 4.524 |
| 6/4/18 | 4.65 |
| 6/5/18 | 4.59 |
| 6/6/18 | 4.598 |
| 6/7/18 | 4.554 |
| 6/8/18 | 4.48 |
| 6/11/18 | 4.477 |
| 6/12/18 | 4.523 |
| 6/13/18 | 4.595 |
| 6/14/18 | 4.632 |
| 6/15/18 | 4.727 |
| 6/18/18 | 4.727 |
| 6/19/18 | 4.706 |
| 6/20/18 | 4.732 |
| 6/21/18 | 4.731 |
| 6/22/18 | 4.718 |
| 6/25/18 | 4.66 |
| 6/26/18 | 4.679 |
| 6/27/18 | 4.617 |
| 6/28/18 | 4.624 |
| 6/29/18 | 4.583 |
| 7/2/18 | 4.591 |
| 7/3/18 | 4.618 |
| 7/4/18 | 4.672 |
| 7/5/18 | 4.669 |
| 7/6/18 | 4.594 |
| 7/9/18 | 4.569 |
| 7/10/18 | 4.736 |
| 7/11/18 | 4.704 |
| 7/12/18 | 4.874 |
| 7/13/18 | 4.854 |
| 7/16/18 | 4.844 |
| 7/17/18 | 4.845 |
| 7/18/18 | 4.807 |
| 7/19/18 | 4.797 |
| 7/20/18 | 4.806 |
| 7/23/18 | 4.794 |
| 7/24/18 | 4.742 |
| 7/25/18 | 4.888 |
| 7/26/18 | 4.77 |
| 7/27/18 | 4.864 |
| 7/30/18 | 4.846 |
| 7/31/18 | 4.884 |
| 8/1/18 | 4.914 |
| 8/2/18 | 4.992 |
| 8/3/18 | 5.066 |
| 8/6/18 | 5.08 |
| 8/7/18 | 5.328 |
| 8/8/18 | 5.231 |
| 8/9/18 | 5.284 |
| 8/10/18 | 5.545 |
| 8/13/18 | 6.436 |
| 8/14/18 | 6.887 |
| 8/15/18 | 6.34 |
| 8/16/18 | 5.928 |
| 8/17/18 | 5.82 |
| 8/20/18 | 6.028 |
| 8/21/18 | 6.105 |
| 8/22/18 | 6.072 |
| 8/23/18 | 6.056 |
| 8/24/18 | 6.097 |
| 8/27/18 | 6.006 |
| 8/28/18 | 6.146 |
| 8/29/18 | 6.303 |
| 8/30/18 | 6.452 |
| 8/31/18 | 6.674 |
| 9/3/18 | 6.53 |
| 9/4/18 | 6.62 |
| 9/5/18 | 6.675 |
| 9/6/18 | 6.61 |
| 9/7/18 | 6.581 |
| 9/10/18 | 6.396 |
| 9/11/18 | 6.47 |
| 9/12/18 | 6.427 |
| 9/13/18 | 6.355 |
| 9/14/18 | 6.064 |
| 9/17/18 | 6.181 |
| 9/18/18 | 6.326 |
| 9/19/18 | 6.389 |
| 9/20/18 | 6.264 |
| 9/21/18 | 6.201 |
| 9/24/18 | 6.242 |
| 9/25/18 | 6.132 |
| 9/26/18 | 6.157 |
| 9/27/18 | 6.122 |
| 9/28/18 | 6.009 |
| 10/1/18 | 6.067 |
| 10/2/18 | 5.932 |
| 10/3/18 | 5.973 |
| 10/4/18 | 6.039 |
| 10/5/18 | 6.152 |
| 10/8/18 | 6.138 |
| 10/9/18 | 6.106 |
| 10/10/18 | 6.104 |
| 10/11/18 | 6.072 |
| 10/12/18 | 5.925 |
| 10/15/18 | 5.87 |
| 10/16/18 | 5.79 |
| 10/17/18 | 5.682 |
| 10/18/18 | 5.576 |
| 10/19/18 | 5.634 |
| 10/22/18 | 5.652 |
| 10/23/18 | 5.668 |
| 10/24/18 | 5.747 |
| 10/25/18 | 5.704 |
| 10/26/18 | 5.635 |
| 10/29/18 | 5.597 |
| 10/30/18 | 5.568 |
| 10/31/18 | 5.468 |
| 11/1/18 | 5.587 |
| 11/2/18 | 5.508 |
| 11/5/18 | 5.43 |
| 11/6/18 | 5.313 |
| 11/7/18 | 5.362 |
| 11/8/18 | 5.357 |
| 11/9/18 | 5.45 |
| 11/12/18 | 5.468 |
| 11/13/18 | 5.465 |
| 11/14/18 | 5.483 |
| 11/15/18 | 5.461 |
| 11/16/18 | 5.348 |
| 11/19/18 | 5.34 |
| 11/20/18 | 5.3 |
| 11/21/18 | 5.377 |
| 11/22/18 | 5.312 |
| 11/23/18 | 5.287 |
| 11/26/18 | 5.288 |
| 11/27/18 | 5.247 |
| 11/28/18 | 5.279 |
| 11/29/18 | 5.231 |
| 11/30/18 | 5.162 |
| 12/3/18 | 5.221 |
| 12/4/18 | 5.255 |
| 12/5/18 | 5.383 |
| 12/6/18 | 5.326 |
| 12/7/18 | 5.331 |
| 12/10/18 | 5.299 |
| 12/11/18 | 5.319 |
| 12/12/18 | 5.37 |
| 12/13/18 | 5.352 |
| 12/14/18 | 5.335 |
| 12/17/18 | 5.364 |
| 12/18/18 | 5.37 |
| 12/19/18 | 5.343 |
| 12/20/18 | 5.293 |
| 12/21/18 | 5.262 |
| 12/24/18 | 5.32 |
| 12/25/18 | 5.3 |
| 12/26/18 | 5.296 |
| 12/27/18 | 5.275 |
| 12/28/18 | 5.285 |
| 12/31/18 | 5.272 |
| 1/1/19 | 5.29 |
| 1/2/19 | 5.301 |
| 1/3/19 | 5.4 |
| 1/4/19 | 5.459 |
| 1/7/19 | 5.336 |
| 1/8/19 | 5.381 |
| 1/9/19 | 5.48 |
| 1/10/19 | 5.48 |
| 1/11/19 | 5.42 |
| 1/14/19 | 5.463 |
| 1/15/19 | 5.446 |
| 1/16/19 | 5.45 |
| 1/17/19 | 5.333 |
| 1/18/19 | 5.343 |
| 1/21/19 | 5.326 |
| 1/22/19 | 5.326 |
| 1/23/19 | 5.34 |
| 1/24/19 | 5.285 |
| 1/25/19 | 5.262 |
| 1/28/19 | 5.258 |
| 1/29/19 | 5.324 |
| 1/30/19 | 5.31 |
| 1/31/19 | 5.226 |
| 2/1/19 | 5.158 |
| 2/4/19 | 5.203 |
| 2/5/19 | 5.222 |
| 2/6/19 | 5.201 |
| 2/7/19 | 5.218 |
| 2/8/19 | 5.264 |
| 2/11/19 | 5.25 |
| 2/12/19 | 5.279 |
| 2/13/19 | 5.254 |
| 2/14/19 | 5.283 |
| 2/15/19 | 5.27 |
| 2/18/19 | 5.282 |
| 2/19/19 | 5.293 |
| 2/20/19 | 5.284 |
| 2/21/19 | 5.329 |
| 2/22/19 | 5.316 |
| 2/25/19 | 5.32 |
| 2/26/19 | 5.305 |
| 2/27/19 | 5.305 |
| 2/28/19 | 5.308 |
| 3/1/19 | 5.337 |
| 3/4/19 | 5.378 |
| 3/5/19 | 5.372 |
| 3/6/19 | 5.387 |
| 3/7/19 | 5.427 |
| 3/8/19 | 5.474 |
| 3/11/19 | 5.427 |
| 3/12/19 | 5.444 |
| 3/13/19 | 5.456 |
| 3/14/19 | 5.457 |
| 3/15/19 | 5.466 |
| 3/18/19 | 5.448 |
| 3/19/19 | 5.467 |
| 3/20/19 | 5.476 |
| 3/21/19 | 5.424 |
| 3/22/19 | 5.465 |
| 3/25/19 | 5.763 |
| 3/26/19 | 5.547 |
| 3/27/19 | 5.337 |
| 3/28/19 | 5.346 |
| 3/29/19 | 5.573 |
| 4/1/19 | 5.556 |
| 4/2/19 | 5.486 |
| 4/3/19 | 5.607 |
| 4/4/19 | 5.626 |
| 4/5/19 | 5.589 |
| 4/8/19 | 5.626 |
| 4/9/19 | 5.69 |
| 4/10/19 | 5.692 |
| 4/11/19 | 5.683 |
| 4/12/19 | 5.736 |
| 4/15/19 | 5.768 |
| 4/16/19 | 5.807 |
| 4/17/19 | 5.771 |
| 4/18/19 | 5.745 |
| 4/19/19 | 5.8 |
| 4/22/19 | 5.811 |
| 4/23/19 | 5.827 |
| 4/24/19 | 5.83 |
| 4/25/19 | 5.875 |
| 4/26/19 | 5.928 |
| 4/29/19 | 5.934 |
| 4/30/19 | 5.949 |
| 5/1/19 | 5.967 |
| 5/2/19 | 5.967 |
| 5/3/19 | 5.974 |
| 5/6/19 | 5.966 |
| 5/7/19 | 6.078 |
| 5/8/19 | 6.148 |
| 5/9/19 | 6.181 |
| 5/10/19 | 6.199 |
| 5/13/19 | 6.006 |
| 5/14/19 | 6.061 |
| 5/15/19 | 6.034 |
| 5/16/19 | 6.004 |
| 5/17/19 | 6.042 |
| 5/20/19 | 6.063 |
| 5/21/19 | 6.029 |
| 5/22/19 | 6.061 |
| 5/23/19 | 6.096 |
| 5/24/19 | 6.096 |
| 5/27/19 | 6.09 |
| 5/28/19 | 6.065 |
| 5/29/19 | 6.03 |
| 5/30/19 | 6.01 |
| 5/31/19 | 5.879 |
| 6/3/19 | 5.844 |
| 6/4/19 | 5.838 |
| 6/5/19 | 5.783 |
| 6/6/19 | 5.73 |
| 6/7/19 | 5.777 |
| 6/10/19 | 5.832 |
| 6/11/19 | 5.781 |
| 6/12/19 | 5.797 |
| 6/13/19 | 5.809 |
| 6/14/19 | 5.865 |
| 6/17/19 | 5.903 |
| 6/18/19 | 5.874 |
| 6/19/19 | 5.835 |
| 6/20/19 | 5.795 |
| 6/21/19 | 5.761 |
| 6/24/19 | 5.821 |
| 6/25/19 | 5.809 |
| 6/26/19 | 5.793 |
| 6/27/19 | 5.777 |
| 6/28/19 | 5.776 |
| 7/1/19 | 5.799 |
| 7/2/19 | 5.653 |
| 7/3/19 | 5.663 |
| 7/4/19 | 5.624 |
| 7/5/19 | 5.595 |
| 7/8/19 | 5.63 |
| 7/9/19 | 5.739 |
| 7/10/19 | 5.729 |
| 7/11/19 | 5.676 |
| 7/12/19 | 5.683 |
| 7/15/19 | 5.722 |
| 7/16/19 | 5.712 |
| 7/17/19 | 5.713 |
| 7/18/19 | 5.686 |
| 7/19/19 | 5.618 |
| 7/22/19 | 5.64 |
| 7/23/19 | 5.68 |
| 7/24/19 | 5.721 |
| 7/25/19 | 5.709 |
| 7/26/19 | 5.702 |
| 7/29/19 | 5.676 |
| 7/30/19 | 5.616 |
| 7/31/19 | 5.556 |
| 8/1/19 | 5.581 |
| 8/2/19 | 5.603 |
| 8/5/19 | 5.56 |
| 8/6/19 | 5.566 |
| 8/7/19 | 5.52 |
| 8/8/19 | 5.5 |
| 8/9/19 | 5.476 |
| 8/12/19 | 5.495 |
| 8/13/19 | 5.567 |
| 8/14/19 | 5.561 |
| 8/15/19 | 5.614 |
| 8/16/19 | 5.568 |
| 8/19/19 | 5.586 |
| 8/20/19 | 5.662 |
| 8/21/19 | 5.736 |
| 8/22/19 | 5.718 |
| 8/23/19 | 5.769 |
| 8/26/19 | 5.765 |
| 8/27/19 | 5.83 |
| 8/28/19 | 5.831 |
| 8/29/19 | 5.812 |
| 8/30/19 | 5.839 |
| 9/2/19 | 5.833 |
| 9/3/19 | 5.807 |
| 9/4/19 | 5.728 |
| 9/5/19 | 5.671 |
| 9/6/19 | 5.692 |
| 9/9/19 | 5.714 |
| 9/10/19 | 5.752 |
| 9/11/19 | 5.77 |
| 9/12/19 | 5.756 |
| 9/13/19 | 5.656 |
| 9/16/19 | 5.689 |
| 9/17/19 | 5.729 |
| 9/18/19 | 5.705 |
| 9/19/19 | 5.68 |
| 9/20/19 | 5.715 |
| 9/23/19 | 5.743 |
| 9/24/19 | 5.716 |
| 9/25/19 | 5.699 |
| 9/26/19 | 5.671 |
| 9/27/19 | 5.665 |
| 9/30/19 | 5.671 |
| 10/1/19 | 5.646 |
| 10/2/19 | 5.727 |
| 10/3/19 | 5.702 |
| 10/4/19 | 5.693 |
| 10/7/19 | 5.705 |
| 10/8/19 | 5.834 |
| 10/9/19 | 5.831 |
| 10/10/19 | 5.872 |
| 10/11/19 | 5.835 |
| 10/14/19 | 5.885 |
| 10/15/19 | 5.935 |
| 10/16/19 | 5.913 |
| 10/17/19 | 5.887 |
| 10/18/19 | 5.829 |
| 10/21/19 | 5.795 |
| 10/22/19 | 5.858 |
| 10/23/19 | 5.809 |
| 10/24/19 | 5.734 |
| 10/25/19 | 5.762 |
| 10/28/19 | 5.777 |
| 10/29/19 | 5.733 |
| 10/30/19 | 5.735 |
| 10/31/19 | 5.707 |
| 11/1/19 | 5.725 |
| 11/4/19 | 5.706 |
| 11/5/19 | 5.738 |
| 11/6/19 | 5.754 |
| 11/7/19 | 5.752 |
| 11/8/19 | 5.752 |
| 11/11/19 | 5.771 |
| 11/12/19 | 5.77 |
| 11/13/19 | 5.775 |
| 11/14/19 | 5.742 |
| 11/15/19 | 5.745 |
| 11/18/19 | 5.746 |
| 11/19/19 | 5.73 |
| 11/19/19 | 5.695 |
| 11/20/19 | 5.702 |
| 11/20/19 | 5.695 |
| 11/21/19 | 5.703 |
| 11/21/19 | 5.692 |
| 11/22/19 | 5.689 |
| 11/24/19 | 5.712 |
| 11/25/19 | 5.725 |
| 11/25/19 | 5.739 |
| 11/26/19 | 5.742 |
| 11/26/19 | 5.756 |
| 11/27/19 | 5.758 |
| 11/27/19 | 5.773 |
| 11/28/19 | 5.78 |
| 11/28/19 | 5.749 |
| 11/29/19 | 5.75 |
| 12/1/19 | 5.747 |
| 12/2/19 | 5.749 |
| 12/2/19 | 5.736 |
| 12/3/19 | 5.74 |
| 12/3/19 | 5.74 |
| 12/4/19 | 5.743 |
| 12/4/19 | 5.746 |
| 12/5/19 | 5.746 |
| 12/5/19 | 5.743 |
| 12/6/19 | 5.746 |
| 12/8/19 | 5.776 |
| 12/9/19 | 5.779 |
| 12/9/19 | 5.808 |
| 12/10/19 | 5.81 |
| 12/10/19 | 5.803 |
| 12/11/19 | 5.804 |
| 12/11/19 | 5.806 |
| 12/12/19 | 5.808 |
| 12/12/19 | 5.789 |
| 12/13/19 | 5.788 |
| 12/15/19 | 5.807 |
| 12/16/19 | 5.812 |
| 12/16/19 | 5.847 |
| 12/17/19 | 5.85 |
| 12/17/19 | 5.884 |
| 12/18/19 | 5.887 |
| 12/18/19 | 5.924 |
| 12/19/19 | 5.926 |
| 12/19/19 | 5.937 |
| 12/20/19 | 5.942 |
| 12/22/19 | 5.936 |
| 12/23/19 | 5.939 |
| 12/23/19 | 5.948 |
| 12/24/19 | 5.947 |
| 12/24/19 | 5.945 |
| 12/25/19 | 5.946 |
| 12/25/19 | 5.936 |
| 12/26/19 | 5.934 |
| 12/26/19 | 5.932 |
| 12/27/19 | 5.926 |
| 12/29/19 | 5.949 |
| 12/30/19 | 5.952 |
| 12/30/19 | 5.946 |
| 12/31/19 | 5.945 |
| 12/31/19 | 5.945 |
| 1/1/20 | 5.946 |
| 1/1/20 | 5.944 |
| 1/2/20 | 5.946 |
| 1/2/20 | 5.955 |
| 1/3/20 | 5.954 |
| 1/5/20 | 5.971 |
| 1/6/20 | 5.976 |
| 1/6/20 | 5.968 |
| 1/7/20 | 5.968 |
| 1/7/20 | 5.971 |
| 1/8/20 | 5.971 |
| 1/8/20 | 5.905 |
| 1/9/20 | 5.909 |
| 1/9/20 | 5.869 |
| 1/10/20 | 5.871 |
| 1/12/20 | 5.885 |
| 1/13/20 | 5.884 |
| 1/13/20 | 5.864 |
| 1/14/20 | 5.867 |
| 1/14/20 | 5.878 |
| 1/15/20 | 5.882 |
| 1/15/20 | 5.874 |
| 1/16/20 | 5.877 |
| 1/16/20 | 5.858 |
| 1/17/20 | 5.857 |
| 1/19/20 | 5.89 |
| 1/20/20 | 5.881 |
| 1/20/20 | 5.911 |
| 1/21/20 | 5.912 |
| 1/21/20 | 5.936 |
| 1/22/20 | 5.94 |
| 1/22/20 | 5.923 |
| 1/23/20 | 5.922 |
| 1/23/20 | 5.932 |
| 1/24/20 | 5.931 |
| 1/26/20 | 5.938 |
| 1/27/20 | 5.939 |
| 1/27/20 | 5.942 |
| 1/28/20 | 5.942 |
| 1/28/20 | 5.94 |
| 1/29/20 | 5.941 |
| 1/29/20 | 5.959 |
| 1/30/20 | 5.962 |
| 1/30/20 | 5.975 |
| 1/31/20 | 5.973 |
| 2/2/20 | 5.968 |
| 2/3/20 | 5.983 |
| 2/3/20 | 5.983 |
| 2/4/20 | 5.984 |
| 2/4/20 | 5.978 |
| 2/5/20 | 5.982 |
| 2/5/20 | 5.981 |
| 2/6/20 | 5.98 |
| 2/6/20 | 5.986 |
| 2/7/20 | 5.987 |
| 2/9/20 | 6.01 |
| 2/10/20 | 6.016 |
| 2/10/20 | 6.008 |
| 2/11/20 | 6.01 |
| 2/11/20 | 6.01 |
| 2/12/20 | 6.013 |
| 2/12/20 | 6.045 |
| 2/13/20 | 6.048 |
| 2/13/20 | 6.037 |
| 2/14/20 | 6.038 |
| 2/16/20 | 6.055 |
| 2/17/20 | 6.054 |
| 2/17/20 | 6.041 |
| 2/18/20 | 6.046 |
| 2/18/20 | 6.059 |
| 2/19/20 | 6.063 |
| 2/19/20 | 6.082 |
| 2/20/20 | 6.082 |
| 2/20/20 | 6.094 |
| 2/21/20 | 6.1 |
| 2/23/20 | 6.096 |
| 2/24/20 | 6.096 |
| 2/24/20 | 6.114 |
| 2/25/20 | 6.119 |
| 2/25/20 | 6.144 |
| 2/26/20 | 6.144 |
| 2/26/20 | 6.156 |
| 2/27/20 | 6.157 |
| 2/27/20 | 6.207 |
| 2/28/20 | 6.211 |
| 3/1/20 | 6.244 |
| 3/2/20 | 6.245 |
| 3/2/20 | 6.162 |
| 3/3/20 | 6.178 |
| 3/3/20 | 6.103 |
| 3/4/20 | 6.106 |
| 3/4/20 | 6.075 |
| 3/5/20 | 6.078 |
| 3/5/20 | 6.105 |
| 3/6/20 | 6.11 |
| 3/8/20 | 6.092 |
| 3/9/20 | 6.092 |
| 3/9/20 | 6.152 |
| 3/10/20 | 6.148 |
| 3/10/20 | 6.176 |
| 3/11/20 | 6.158 |
| 3/11/20 | 6.212 |
| 3/12/20 | 6.209 |
| 3/12/20 | 6.31 |
| 3/13/20 | 6.314 |
| 3/15/20 | 6.321 |
| 3/16/20 | 6.331 |
| 3/16/20 | 6.422 |
| 3/17/20 | 6.431 |
| 3/17/20 | 6.396 |
| 3/18/20 | 6.392 |
| 3/18/20 | 6.469 |
| 3/19/20 | 6.488 |
| 3/19/20 | 6.543 |
| 3/20/20 | 6.542 |
| 3/22/20 | 6.551 |
| 3/23/20 | 6.554 |
| 3/23/20 | 6.555 |
| 3/24/20 | 6.562 |
| 3/24/20 | 6.421 |
| 3/25/20 | 6.423 |
| 3/25/20 | 6.412 |
| 3/26/20 | 6.416 |
| 3/26/20 | 6.393 |
| 3/27/20 | 6.396 |
| 3/29/20 | 6.453 |
| 3/30/20 | 6.458 |
| 3/30/20 | 6.568 |
| 3/31/20 | 6.579 |
| 3/31/20 | 6.612 |
| 4/1/20 | 6.618 |
| 4/1/20 | 6.708 |
| 4/2/20 | 6.7 |
| 4/2/20 | 6.631 |
| 4/3/20 | 6.615 |
| 4/5/20 | 6.732 |
| 4/6/20 | 6.73 |
| 4/6/20 | 6.764 |
| 4/7/20 | 6.779 |
| 4/7/20 | 6.761 |
| 4/8/20 | 6.752 |
| 4/8/20 | 6.767 |
| 4/9/20 | 6.775 |
| 4/9/20 | 6.658 |
| 4/10/20 | 6.677 |
| 4/12/20 | 6.695 |
| 4/13/20 | 6.703 |
| 4/13/20 | 6.771 |
| 4/14/20 | 6.77 |
| 4/14/20 | 6.815 |
| 4/15/20 | 6.819 |
| 4/15/20 | 6.905 |
| 4/16/20 | 6.91 |
| 4/16/20 | 6.92 |
| 4/17/20 | 6.938 |
| 4/19/20 | 6.93 |
| 4/20/20 | 6.93 |
| 4/20/20 | 6.937 |
| 4/21/20 | 6.94 |
| 4/21/20 | 6.972 |
| 4/22/20 | 6.981 |
| 4/22/20 | 6.971 |
| 4/23/20 | 6.983 |
| 4/23/20 | 6.95 |
| 4/24/20 | 6.94 |
| 4/26/20 | 6.972 |
| 4/27/20 | 6.973 |
| 4/27/20 | 6.982 |
| 4/28/20 | 6.986 |
| 4/28/20 | 6.981 |
| 4/29/20 | 6.989 |
| 4/29/20 | 6.95 |
| 4/30/20 | 6.954 |
| 4/30/20 | 6.987 |
| 5/1/20 | 6.988 |
| 5/3/20 | 7.008 |
| 5/4/20 | 7.013 |
| 5/4/20 | 7.044 |
| 5/5/20 | 7.042 |
| 5/5/20 | 7.063 |
| 5/6/20 | 7.073 |
| 5/6/20 | 7.198 |
| 5/7/20 | 7.198 |
| 5/7/20 | 7.124 |
| 5/8/20 | 7.118 |
| 5/10/20 | 7.082 |
| 5/11/20 | 7.084 |
| 5/11/20 | 7.071 |
| 5/12/20 | 7.07 |
| 5/12/20 | 6.992 |
| 5/13/20 | 7.001 |
| 5/13/20 | 6.97 |
| 5/14/20 | 6.974 |
| 5/14/20 | 6.922 |
| 5/15/20 | 6.92 |
| 5/17/20 | 6.899 |
| 5/18/20 | 6.901 |
| 5/18/20 | 6.88 |
| 5/19/20 | 6.887 |
| 5/19/20 | 6.768 |
| 5/20/20 | 6.778 |
| 5/20/20 | 6.784 |
| 5/21/20 | 6.792 |
| 5/21/20 | 6.787 |
| 5/22/20 | 6.794 |
| 5/24/20 | 6.811 |
| 5/25/20 | 6.816 |
| 5/25/20 | 6.811 |
| 5/26/20 | 6.809 |
| 5/26/20 | 6.704 |
| 5/27/20 | 6.729 |
| 5/27/20 | 6.774 |
| 5/28/20 | 6.773 |
| 5/28/20 | 6.814 |
| 5/29/20 | 6.814 |
| 5/31/20 | 6.82 |
| 6/1/20 | 6.824 |
| 6/1/20 | 6.812 |
| 6/2/20 | 6.812 |
| 6/2/20 | 6.685 |
| 6/3/20 | 6.705 |
| 6/3/20 | 6.726 |
| 6/4/20 | 6.746 |
| 6/4/20 | 6.75 |
| 6/5/20 | 6.754 |
| 6/7/20 | 6.768 |
| 6/8/20 | 6.757 |
| 6/8/20 | 6.785 |
| 6/9/20 | 6.788 |
| 6/9/20 | 6.796 |
| 6/10/20 | 6.796 |
| 6/10/20 | 6.778 |
| 6/11/20 | 6.775 |
| 6/11/20 | 6.831 |
| 6/12/20 | 6.842 |
| 6/14/20 | 6.809 |
| 6/15/20 | 6.812 |
| 6/15/20 | 6.835 |
| 6/16/20 | 6.838 |
| 6/16/20 | 6.847 |
| 6/17/20 | 6.844 |
| 6/17/20 | 6.837 |
| 6/18/20 | 6.844 |
| 6/18/20 | 6.855 |
| 6/19/20 | 6.858 |
| 6/21/20 | 6.85 |
| 6/22/20 | 6.847 |
| 6/22/20 | 6.846 |
| 6/23/20 | 6.849 |
| 6/23/20 | 6.847 |
| 6/24/20 | 6.85 |
| 6/24/20 | 6.849 |
| 6/25/20 | 6.854 |
| 6/25/20 | 6.853 |
| 6/26/20 | 6.858 |
| 6/28/20 | 6.854 |
| 6/29/20 | 6.851 |
| 6/29/20 | 6.853 |
| 6/30/20 | 6.852 |
| 6/30/20 | 6.85 |
| 7/1/20 | 6.855 |
| 7/1/20 | 6.848 |
| 7/2/20 | 6.847 |
| 7/2/20 | 6.85 |
| 7/3/20 | 6.85 |
| 7/5/20 | 6.861 |
| 7/6/20 | 6.861 |
| 7/6/20 | 6.858 |
| 7/7/20 | 6.862 |
| 7/7/20 | 6.854 |
| 7/8/20 | 6.86 |
| 7/8/20 | 6.86 |
| 7/9/20 | 6.86 |
| 7/9/20 | 6.857 |
| 7/10/20 | 6.863 |
| 7/12/20 | 6.862 |
| 7/13/20 | 6.87 |
| 7/13/20 | 6.856 |
| 7/14/20 | 6.858 |
| 7/14/20 | 6.863 |
| 7/15/20 | 6.865 |
| 7/15/20 | 6.856 |
| 7/16/20 | 6.857 |
| 7/16/20 | 6.857 |
| 7/17/20 | 6.86 |
| 7/19/20 | 6.857 |
| 7/20/20 | 6.856 |
| 7/20/20 | 6.85 |
| 7/21/20 | 6.859 |
| 7/21/20 | 6.822 |
| 7/22/20 | 6.822 |
| 7/22/20 | 6.839 |
| 7/23/20 | 6.855 |
| 7/23/20 | 6.837 |
| 7/24/20 | 6.843 |
| 7/26/20 | 6.845 |
| 7/27/20 | 6.845 |
| 7/27/20 | 6.865 |
| 7/28/20 | 6.862 |
| 7/28/20 | 6.93 |
| 7/29/20 | 6.934 |
| 7/29/20 | 6.971 |
| 7/30/20 | 6.982 |
| 7/30/20 | 6.979 |
| 7/31/20 | 6.995 |
| 8/2/20 | 6.97 |
| 8/3/20 | 6.975 |
| 8/3/20 | 6.941 |
| 8/4/20 | 6.957 |
| 8/4/20 | 6.927 |
| 8/5/20 | 6.901 |
| 8/5/20 | 7.038 |
| 8/6/20 | 7.047 |
| 8/6/20 | 7.218 |
| 8/7/20 | 7.24 |
| 8/9/20 | 7.287 |
| 8/10/20 | 7.289 |
| 8/10/20 | 7.329 |
| 8/11/20 | 7.359 |
| 8/11/20 | 7.184 |
| 8/12/20 | 7.205 |
| 8/12/20 | 7.322 |
| 8/13/20 | 7.332 |
| 8/13/20 | 7.352 |
| 8/14/20 | 7.339 |
| 8/16/20 | 7.372 |
| 8/17/20 | 7.375 |
| 8/17/20 | 7.384 |
| 8/18/20 | 7.385 |
| 8/18/20 | 7.365 |
| 8/19/20 | 7.372 |
| 8/19/20 | 7.283 |
| 8/20/20 | 7.293 |
| 8/20/20 | 7.298 |
| 8/21/20 | 7.296 |
| 8/23/20 | 7.335 |
| 8/24/20 | 7.333 |
| 8/24/20 | 7.374 |
| 8/25/20 | 7.379 |
| 8/25/20 | 7.392 |
| 8/26/20 | 7.394 |
| 8/26/20 | 7.368 |
| 8/27/20 | 7.369 |
| 8/27/20 | 7.345 |
| 8/28/20 | 7.357 |
| 8/30/20 | 7.333 |
| 8/31/20 | 7.333 |
| 8/31/20 | 7.341 |
| 9/1/20 | 7.351 |
| 9/1/20 | 7.366 |
| 9/2/20 | 7.368 |
| 9/2/20 | 7.376 |
| 9/3/20 | 7.384 |
| 9/3/20 | 7.43 |
| 9/4/20 | 7.436 |
| 9/6/20 | 7.433 |
| 9/7/20 | 7.434 |
| 9/7/20 | 7.456 |
| 9/8/20 | 7.456 |
| 9/8/20 | 7.485 |
| 9/9/20 | 7.482 |
| 9/9/20 | 7.479 |
| 9/10/20 | 7.487 |
| 9/10/20 | 7.447 |
| 9/11/20 | 7.452 |
| 9/13/20 | 7.472 |
| 9/14/20 | 7.472 |
| 9/14/20 | 7.472 |
| 9/15/20 | 7.492 |
| 9/15/20 | 7.49 |
| 9/16/20 | 7.488 |
| 9/16/20 | 7.484 |
| 9/17/20 | 7.504 |
| 9/17/20 | 7.543 |
| 9/18/20 | 7.551 |
| 9/20/20 | 7.551 |
| 9/21/20 | 7.56 |
| 9/21/20 | 7.63 |
| 9/22/20 | 7.631 |
| 9/22/20 | 7.666 |
| 9/23/20 | 7.666 |
| 9/23/20 | 7.697 |
| 9/24/20 | 7.7 |
| 9/24/20 | 7.618 |
| 9/25/20 | 7.623 |
| 9/27/20 | 7.661 |
| 9/28/20 | 7.663 |
| 9/28/20 | 7.789 |
| 9/29/20 | 7.807 |
| 9/29/20 | 7.806 |
| 9/30/20 | 7.819 |
| 9/30/20 | 7.72 |
| 10/1/20 | 7.719 |
| 10/1/20 | 7.726 |
| 10/2/20 | 7.751 |
| 10/4/20 | 7.77 |
| 10/5/20 | 7.773 |
| 10/5/20 | 7.762 |
| 10/6/20 | 7.764 |
| 10/6/20 | 7.798 |
| 10/7/20 | 7.801 |
| 10/7/20 | 7.88 |
| 10/8/20 | 7.885 |
| 10/8/20 | 7.939 |
| 10/9/20 | 7.943 |
| 10/11/20 | 7.856 |
| 10/12/20 | 7.861 |
| 10/12/20 | 7.892 |
| 10/13/20 | 7.891 |
| 10/13/20 | 7.925 |
| 10/14/20 | 7.916 |
| 10/14/20 | 7.907 |
| 10/15/20 | 7.912 |
| 10/15/20 | 7.931 |
| 10/16/20 | 7.935 |
| 10/18/20 | 7.931 |
| 10/19/20 | 7.935 |
| 10/19/20 | 7.879 |
| 10/20/20 | 7.884 |
| 10/20/20 | 7.859 |
| 10/21/20 | 7.866 |
| 10/21/20 | 7.808 |
| 10/22/20 | 7.81 |
| 10/22/20 | 7.938 |
| 10/23/20 | 7.937 |
| 10/25/20 | 7.961 |
| 10/26/20 | 7.964 |
| 10/26/20 | 8.091 |
| 10/27/20 | 8.082 |
| 10/27/20 | 8.19 |
| 10/28/20 | 8.184 |
| 10/28/20 | 8.263 |
| 10/29/20 | 8.26 |
| 10/29/20 | 8.293 |
| 10/30/20 | 8.291 |
| 11/1/20 | 8.345 |
| 11/2/20 | 8.345 |
| 11/2/20 | 8.419 |
| 11/3/20 | 8.421 |
| 11/3/20 | 8.402 |
| 11/4/20 | 8.401 |
| 11/4/20 | 8.424 |
| 11/5/20 | 8.426 |
| 11/5/20 | 8.42 |
| 11/6/20 | 8.425 |
| 11/8/20 | 8.503 |
| 11/9/20 | 8.42 |
| 11/9/20 | 8.063 |
| 11/10/20 | 8.066 |
| 11/10/20 | 8.16 |
| 11/11/20 | 8.146 |
| 11/11/20 | 7.797 |
| 11/12/20 | 7.8 |
| 11/12/20 | 7.687 |
| 11/13/20 | 7.691 |
| 11/15/20 | 7.64 |
| 11/16/20 | 7.682 |
| 11/16/20 | 7.688 |
| 11/17/20 | 7.704 |
| 11/17/20 | 7.696 |
| 11/18/20 | 7.698 |
| 11/18/20 | 7.71 |
| 11/19/20 | 7.706 |
| 11/19/20 | 7.551 |
| 11/20/20 | 7.554 |
| 11/22/20 | 7.632 |
| 11/23/20 | 7.64 |
| 11/23/20 | 7.881 |
| 11/24/20 | 7.885 |
| 11/24/20 | 7.998 |
| 11/25/20 | 8 |
| 11/25/20 | 7.93 |
| 11/26/20 | 7.931 |
| 11/26/20 | 7.868 |
| 11/27/20 | 7.87 |
| 11/29/20 | 7.833 |
| 11/30/20 | 7.834 |
| 11/30/20 | 7.828 |
| 12/1/20 | 7.833 |
| 12/1/20 | 7.84 |
| 12/2/20 | 7.827 |
| 12/2/20 | 7.86 |
| 12/3/20 | 7.858 |
| 12/3/20 | 7.766 |
| 12/4/20 | 7.774 |
| 12/6/20 | 7.798 |
| 12/7/20 | 7.802 |
| 12/7/20 | 7.797 |
| 12/8/20 | 7.806 |
| 12/8/20 | 7.81 |
| 12/9/20 | 7.825 |
| 12/9/20 | 7.821 |
| 12/10/20 | 7.823 |
| 12/10/20 | 7.874 |
| 12/11/20 | 7.887 |
| 12/13/20 | 7.856 |
| 12/14/20 | 7.86 |
| 12/14/20 | 7.848 |
| 12/15/20 | 7.853 |
| 12/15/20 | 7.83 |
| 12/16/20 | 7.836 |
| 12/16/20 | 7.794 |
| 12/17/20 | 7.8 |
| 12/17/20 | 7.699 |
| 12/18/20 | 7.701 |
| 12/20/20 | 7.624 |
| 12/21/20 | 7.631 |
| 12/21/20 | 7.65 |
| 12/22/20 | 7.654 |
| 12/22/20 | 7.656 |
| 12/23/20 | 7.663 |
| 12/23/20 | 7.637 |
| 12/24/20 | 7.64 |
| 12/24/20 | 7.584 |
| 12/25/20 | 7.586 |
| 12/27/20 | 7.584 |
| 12/28/20 | 7.57 |
| 12/28/20 | 7.432 |
| 12/29/20 | 7.45 |
| 12/29/20 | 7.378 |
| 12/30/20 | 7.387 |
| 12/30/20 | 7.378 |
| 12/31/20 | 7.384 |
| 12/31/20 | 7.426 |
| 1/1/21 | 7.439 |
| 1/3/21 | 7.426 |
| 1/4/21 | 7.44 |
| 1/4/21 | 7.427 |
| 1/5/21 | 7.429 |
| 1/5/21 | 7.382 |
| 1/6/21 | 7.383 |
| 1/6/21 | 7.294 |
| 1/7/21 | 7.309 |
| 1/7/21 | 7.315 |
| 1/8/21 | 7.32 |
| 1/10/21 | 7.363 |
| 1/11/21 | 7.354 |
| 1/11/21 | 7.476 |
| 1/12/21 | 7.479 |
| 1/12/21 | 7.445 |
| 1/13/21 | 7.461 |
| 1/13/21 | 7.399 |
| 1/14/21 | 7.401 |
| 1/14/21 | 7.363 |
| 1/15/21 | 7.346 |
| 1/17/21 | 7.473 |
| 1/18/21 | 7.473 |
| 1/18/21 | 7.477 |
| 1/19/21 | 7.483 |
| 1/19/21 | 7.478 |
| 1/20/21 | 7.476 |
| 1/20/21 | 7.414 |
| 1/21/21 | 7.423 |
| 1/21/21 | 7.363 |
| 1/22/21 | 7.367 |
| 1/24/21 | 7.407 |
| 1/25/21 | 7.415 |
| 1/25/21 | 7.402 |
| 1/26/21 | 7.406 |
| 1/26/21 | 7.351 |
| 1/27/21 | 7.347 |
| 1/27/21 | 7.391 |
| 1/28/21 | 7.399 |
| 1/28/21 | 7.342 |
| 1/29/21 | 7.343 |
| 1/31/21 | 7.31 |
| 2/1/21 | 7.316 |
| 2/1/21 | 7.187 |
| 2/2/21 | 7.192 |
| 2/2/21 | 7.185 |
| 2/3/21 | 7.198 |
| 2/3/21 | 7.148 |
| 2/4/21 | 7.162 |
| 2/4/21 | 7.134 |
| 2/5/21 | 7.139 |
| 2/7/21 | 7.044 |
| 2/8/21 | 7.059 |
| 2/8/21 | 7.073 |
| 2/9/21 | 7.076 |
| 2/9/21 | 7.059 |
| 2/10/21 | 7.07 |
| 2/10/21 | 7.053 |
| 2/11/21 | 7.062 |
| 2/11/21 | 7.024 |
| 2/12/21 | 7.022 |
| 2/14/21 | 7.032 |
| 2/15/21 | 7.037 |
| 2/15/21 | 6.96 |
| 2/16/21 | 6.962 |
| 2/16/21 | 6.97 |
| 2/17/21 | 6.994 |
| 2/17/21 | 6.966 |
| 2/18/21 | 6.976 |
| 2/18/21 | 6.971 |
| 2/19/21 | 6.972 |
| 2/21/21 | 6.953 |
| 2/22/21 | 6.966 |
| 2/22/21 | 7.01 |
| 2/23/21 | 7.023 |
| 2/23/21 | 7.106 |
| 2/24/21 | 7.105 |
| 2/24/21 | 7.161 |
| 2/25/21 | 7.17 |
| 2/25/21 | 7.329 |
| 2/26/21 | 7.34 |
| 2/28/21 | 7.423 |
| 3/1/21 | 7.436 |
| 3/1/21 | 7.272 |
| 3/2/21 | 7.284 |
| 3/2/21 | 7.335 |
| 3/3/21 | 7.355 |
| 3/3/21 | 7.445 |
| 3/4/21 | 7.462 |
| 3/4/21 | 7.503 |
| 3/5/21 | 7.507 |
| 3/7/21 | 7.535 |
| 3/8/21 | 7.535 |
| 3/8/21 | 7.734 |
| 3/9/21 | 7.746 |
| 3/9/21 | 7.596 |
| 3/10/21 | 7.617 |
| 3/10/21 | 7.509 |
| 3/11/21 | 7.513 |
| 3/11/21 | 7.47 |
| 3/12/21 | 7.47 |
| 3/14/21 | 7.554 |
| 3/15/21 | 7.564 |
| 3/15/21 | 7.532 |
| 3/16/21 | 7.538 |
| 3/16/21 | 7.492 |
| 3/17/21 | 7.492 |
| 3/17/21 | 7.489 |
| 3/18/21 | 7.507 |
| 3/18/21 | 7.322 |
| 3/19/21 | 7.325 |
| 3/21/21 | 7.216 |
| 3/22/21 | 7.222 |
| 3/22/21 | 7.764 |
| 3/23/21 | 7.806 |
| 3/23/21 | 7.942 |
| 3/24/21 | 7.951 |
| 3/24/21 | 7.88 |
| 3/25/21 | 7.928 |
| 3/25/21 | 7.93 |
| 3/26/21 | 7.943 |
| 3/28/21 | 8.135 |
| 3/29/21 | 8.124 |
| 3/29/21 | 8.236 |
| 3/30/21 | 8.208 |
| 3/30/21 | 8.337 |
| 3/31/21 | 8.326 |
| 3/31/21 | 8.246 |
| 4/1/21 | 8.254 |
| 4/1/21 | 8.106 |
| 4/2/21 | 8.123 |
| 4/4/21 | 8.162 |
| 4/5/21 | 8.177 |
| 4/5/21 | 8.108 |
| 4/6/21 | 8.113 |
| 4/6/21 | 8.126 |
| 4/7/21 | 8.164 |
| 4/7/21 | 8.146 |
| 4/8/21 | 8.159 |
| 4/8/21 | 8.126 |
| 4/9/21 | 8.142 |
| 4/11/21 | 8.153 |
| 4/12/21 | 8.176 |
| 4/12/21 | 8.14 |
| 4/13/21 | 8.149 |
| 4/13/21 | 8.101 |
| 4/14/21 | 8.115 |
| 4/14/21 | 8.064 |
| 4/15/21 | 8.089 |
| 4/15/21 | 8.01 |
| 4/16/21 | 8.02 |
| 4/18/21 | 8.057 |
| 4/19/21 | 8.078 |
| 4/19/21 | 8.083 |
| 4/20/21 | 8.099 |
| 4/20/21 | 8.103 |
| 4/21/21 | 8.123 |
| 4/21/21 | 8.187 |
| 4/22/21 | 8.194 |
| 4/22/21 | 8.306 |
| 4/23/21 | 8.322 |
| 4/25/21 | 8.376 |
| 4/26/21 | 8.4 |
| 4/26/21 | 8.278 |
| 4/27/21 | 8.29 |
| 4/27/21 | 8.202 |
| 4/28/21 | 8.203 |
| 4/28/21 | 8.189 |
| 4/29/21 | 8.195 |
| 4/29/21 | 8.194 |
| 4/30/21 | 8.225 |
| 5/2/21 | 8.274 |
| 5/3/21 | 8.28 |
| 5/3/21 | 8.242 |
| 5/4/21 | 8.24 |
| 5/4/21 | 8.304 |
| 5/5/21 | 8.325 |
| 5/5/21 | 8.312 |
| 5/6/21 | 8.324 |
| 5/6/21 | 8.274 |
| 5/7/21 | 8.282 |
| 5/9/21 | 8.24 |
| 5/10/21 | 8.25 |
| 5/10/21 | 8.259 |
| 5/11/21 | 8.281 |
| 5/11/21 | 8.284 |
| 5/12/21 | 8.296 |
| 5/12/21 | 8.43 |
| 5/13/21 | 8.424 |
| 5/13/21 | 8.495 |
| 5/14/21 | 8.509 |
| 5/16/21 | 8.463 |
| 5/17/21 | 8.468 |
| 5/17/21 | 8.307 |
| 5/18/21 | 8.321 |
| 5/18/21 | 8.339 |
| 5/19/21 | 8.354 |
| 5/19/21 | 8.412 |
| 5/20/21 | 8.413 |
| 5/20/21 | 8.366 |
| 5/21/21 | 8.381 |
| 5/23/21 | 8.414 |
| 5/24/21 | 8.416 |
| 5/24/21 | 8.381 |
| 5/25/21 | 8.388 |
| 5/25/21 | 8.451 |
| 5/26/21 | 8.454 |
| 5/26/21 | 8.451 |
| 5/27/21 | 8.456 |
| 5/27/21 | 8.484 |
| 5/28/21 | 8.509 |
| 5/30/21 | 8.56 |
| 5/31/21 | 8.558 |
| 5/31/21 | 8.479 |
| 6/1/21 | 8.488 |
| 6/1/21 | 8.674 |
| 6/2/21 | 8.542 |
| 6/2/21 | 8.58 |
| 6/3/21 | 8.595 |
| 6/3/21 | 8.687 |
| 6/4/21 | 8.702 |
| 6/6/21 | 8.656 |
| 6/7/21 | 8.67 |
| 6/7/21 | 8.617 |
| 6/8/21 | 8.615 |
| 6/8/21 | 8.602 |
| 6/9/21 | 8.61 |
| 6/9/21 | 8.58 |
| 6/10/21 | 8.582 |
| 6/10/21 | 8.424 |
| 6/11/21 | 8.422 |
| 6/13/21 | 8.42 |
| 6/14/21 | 8.391 |
| 6/14/21 | 8.454 |
| 6/15/21 | 8.474 |
| 6/15/21 | 8.542 |
| 6/16/21 | 8.552 |
| 6/16/21 | 8.601 |
| 6/17/21 | 8.605 |
| 6/17/21 | 8.71 |
| 6/18/21 | 8.724 |
| 6/20/21 | 8.726 |
| 6/21/21 | 8.739 |
| 6/21/21 | 8.771 |
| 6/22/21 | 8.772 |
| 6/22/21 | 8.638 |
| 6/23/21 | 8.653 |
| 6/23/21 | 8.625 |
| 6/24/21 | 8.64 |
| 6/24/21 | 8.703 |
| 6/25/21 | 8.69 |
| 6/27/21 | 8.749 |
| 6/28/21 | 8.769 |
| 6/28/21 | 8.682 |
| 6/29/21 | 8.676 |
| 6/29/21 | 8.724 |
| 6/30/21 | 8.734 |
| 6/30/21 | 8.698 |
| 7/1/21 | 8.712 |
| 7/1/21 | 8.645 |
| 7/2/21 | 8.661 |
| 7/4/21 | 8.679 |
| 7/5/21 | 8.687 |
| 7/5/21 | 8.66 |
| 7/6/21 | 8.669 |
| 7/6/21 | 8.684 |
| 7/7/21 | 8.694 |
| 7/7/21 | 8.681 |
| 7/8/21 | 8.689 |
| 7/8/21 | 8.69 |
| 7/9/21 | 8.69 |
| 7/11/21 | 8.643 |
| 7/12/21 | 8.668 |
| 7/12/21 | 8.634 |
| 7/13/21 | 8.643 |
| 7/13/21 | 8.611 |
| 7/14/21 | 8.625 |
| 7/14/21 | 8.59 |
| 7/15/21 | 8.592 |
| 7/15/21 | 8.564 |
| 7/16/21 | 8.571 |
| 7/18/21 | 8.478 |
| 7/19/21 | 8.532 |
| 7/19/21 | 8.588 |
| 7/20/21 | 8.588 |
| 7/20/21 | 8.557 |
| 7/21/21 | 8.569 |
| 7/21/21 | 8.566 |
| 7/22/21 | 8.525 |
| 7/22/21 | 8.561 |
| 7/23/21 | 8.566 |
| 7/25/21 | 8.547 |
| 7/26/21 | 8.558 |
| 7/26/21 | 8.553 |
| 7/27/21 | 8.558 |
| 7/27/21 | 8.556 |
| 7/28/21 | 8.554 |
| 7/28/21 | 8.55 |
| 7/29/21 | 8.564 |
| 7/29/21 | 8.456 |
| 7/30/21 | 8.474 |
| 8/1/21 | 8.449 |
| 8/2/21 | 8.461 |
| 8/2/21 | 8.352 |
| 8/3/21 | 8.352 |
| 8/3/21 | 8.406 |
| 8/4/21 | 8.408 |
| 8/4/21 | 8.478 |
| 8/5/21 | 8.478 |
| 8/5/21 | 8.524 |
| 8/6/21 | 8.527 |
| 8/8/21 | 8.616 |
| 8/9/21 | 8.627 |
| 8/9/21 | 8.651 |
| 8/10/21 | 8.639 |
| 8/10/21 | 8.607 |
| 8/11/21 | 8.591 |
| 8/11/21 | 8.624 |
| 8/12/21 | 8.633 |
| 8/12/21 | 8.566 |
| 8/13/21 | 8.539 |
| 8/15/21 | 8.517 |
| 8/16/21 | 8.527 |
| 8/16/21 | 8.449 |
| 8/17/21 | 8.459 |
| 8/17/21 | 8.424 |
| 8/18/21 | 8.424 |
| 8/18/21 | 8.428 |
| 8/19/21 | 8.46 |
| 8/19/21 | 8.506 |
| 8/20/21 | 8.498 |
| 8/22/21 | 8.485 |
| 8/23/21 | 8.498 |
| 8/23/21 | 8.414 |
| 8/24/21 | 8.433 |
| 8/24/21 | 8.401 |
| 8/25/21 | 8.409 |
| 8/25/21 | 8.371 |
| 8/26/21 | 8.375 |
| 8/26/21 | 8.382 |
| 8/27/21 | 8.397 |
| 8/29/21 | 8.343 |
| 8/30/21 | 8.355 |
| 8/30/21 | 8.387 |
| 8/31/21 | 8.384 |
| 8/31/21 | 8.302 |
| 9/1/21 | 8.316 |
| 9/1/21 | 8.302 |
| 9/2/21 | 8.292 |
| 9/2/21 | 8.28 |
| 9/3/21 | 8.29 |
| 9/5/21 | 8.305 |
| 9/6/21 | 8.324 |
| 9/6/21 | 8.278 |
| 9/7/21 | 8.283 |
| 9/7/21 | 8.343 |
| 9/8/21 | 8.36 |
| 9/8/21 | 8.459 |
| 9/9/21 | 8.466 |
| 9/9/21 | 8.44 |
| 9/10/21 | 8.444 |
| 9/12/21 | 8.455 |
| 9/13/21 | 8.472 |
| 9/13/21 | 8.427 |
| 9/14/21 | 8.437 |
| 9/14/21 | 8.424 |
| 9/15/21 | 8.439 |
| 9/15/21 | 8.42 |
| 9/16/21 | 8.434 |
| 9/16/21 | 8.524 |
| 9/17/21 | 8.538 |
| 9/19/21 | 8.652 |
| 9/20/21 | 8.652 |
| 9/20/21 | 8.659 |
| 9/21/21 | 8.667 |
| 9/21/21 | 8.622 |
| 9/22/21 | 8.634 |
| 9/22/21 | 8.64 |
| 9/23/21 | 8.65 |
| 9/23/21 | 8.768 |
| 9/24/21 | 8.767 |
| 9/26/21 | 8.859 |
| 9/27/21 | 8.88 |
| 9/27/21 | 8.816 |
| 9/28/21 | 8.825 |
| 9/28/21 | 8.864 |
| 9/29/21 | 8.884 |
| 9/29/21 | 8.906 |
| 9/30/21 | 8.914 |
| 9/30/21 | 8.878 |
| 10/1/21 | 8.883 |
| 10/3/21 | 8.847 |
| 10/4/21 | 8.856 |
| 10/4/21 | 8.86 |
| 10/5/21 | 8.85 |
| 10/5/21 | 8.859 |
| 10/6/21 | 8.875 |
| 10/6/21 | 8.867 |
| 10/7/21 | 8.866 |
| 10/7/21 | 8.869 |
| 10/8/21 | 8.884 |
| 10/10/21 | 8.961 |
| 10/11/21 | 8.988 |
| 10/11/21 | 9 |
| 10/12/21 | 9.004 |
| 10/12/21 | 9.038 |
| 10/13/21 | 9.044 |
| 10/13/21 | 9.145 |
| 10/14/21 | 9.06 |
| 10/14/21 | 9.171 |
| 10/15/21 | 9.19 |
| 10/18/21 | 9.265 |
| 10/18/21 | 9.336 |
| 10/19/21 | 9.335 |
| 10/19/21 | 9.298 |
| 10/20/21 | 9.302 |
| 10/20/21 | 9.212 |
| 10/21/21 | 9.221 |
| 10/21/21 | 9.521 |
| 10/22/21 | 9.537 |
| 10/25/21 | 9.607 |
| 10/25/21 | 9.578 |
| 10/26/21 | 9.591 |
| 10/26/21 | 9.52 |
| 10/27/21 | 9.555 |
| 10/27/21 | 9.475 |
| 10/28/21 | 9.497 |
| 10/28/21 | 9.526 |
| 10/29/21 | 9.531 |
| 11/1/21 | 9.609 |
| 11/1/21 | 9.524 |
| 11/2/21 | 9.541 |
| 11/2/21 | 9.604 |
| 11/3/21 | 9.61 |
| 11/3/21 | 9.632 |
| 11/4/21 | 9.644 |
| 11/4/21 | 9.684 |
| 11/5/21 | 9.689 |
| 11/8/21 | 9.695 |
| 11/8/21 | 9.668 |
| 11/9/21 | 9.676 |
| 11/9/21 | 9.725 |
| 11/10/21 | 9.731 |
| 11/10/21 | 9.838 |
| 11/11/21 | 9.842 |
| 11/11/21 | 9.89 |
| 11/12/21 | 9.897 |
| 11/15/21 | 9.994 |
| 11/15/21 | 10.051 |
| 11/16/21 | 10.054 |
| 11/16/21 | 10.341 |
| 11/17/21 | 10.359 |
| 11/17/21 | 10.623 |
| 11/18/21 | 10.625 |
| 11/18/21 | 10.994 |
| 11/19/21 | 10.964 |
| 11/22/21 | 11.23 |
| 11/22/21 | 11.406 |
| 11/23/21 | 11.34 |
| 11/23/21 | 12.819 |
| 11/24/21 | 12.821 |
| 11/24/21 | 12.086 |
| 11/25/21 | 12.173 |
| 11/25/21 | 11.988 |
| 11/26/21 | 11.91 |
| 11/29/21 | 12.413 |
| 11/29/21 | 12.821 |
| 11/30/21 | 12.826 |
| 11/30/21 | 13.481 |
| 12/1/21 | 13.483 |
| 12/1/21 | 13.264 |
| 12/2/21 | 13.334 |
| 12/2/21 | 13.678 |
| 12/3/21 | 13.681 |
| 12/6/21 | 13.703 |
| 12/6/21 | 13.787 |
| 12/7/21 | 13.797 |
| 12/7/21 | 13.488 |
| 12/8/21 | 13.492 |
| 12/8/21 | 13.672 |
| 12/9/21 | 13.679 |
| 12/9/21 | 13.782 |
| 12/10/21 | 13.786 |
| 12/13/21 | 13.885 |
| 12/13/21 | 13.795 |
| 12/14/21 | 13.814 |
| 12/14/21 | 14.384 |
| 12/15/21 | 14.394 |
| 12/15/21 | 14.782 |
| 12/16/21 | 14.797 |
| 12/16/21 | 15.667 |
| 12/17/21 | 15.673 |
| 12/20/21 | 16.482 |
| 12/20/21 | 13.442 |
| 12/21/21 | 13.382 |
| 12/21/21 | 12.433 |
| 12/22/21 | 12.474 |
| 12/22/21 | 11.99 |
| 12/23/21 | 12.307 |
| 12/23/21 | 11.396 |
| 12/24/21 | 11.045 |
| 12/27/21 | 10.502 |
| 12/27/21 | 11.68 |
| 12/28/21 | 11.687 |
| 12/28/21 | 11.798 |
| 12/29/21 | 11.8 |
| 12/29/21 | 12.631 |
| 12/30/21 | 12.826 |
| 12/30/21 | 13.146 |
| 12/31/21 | 12.943 |
| 1/3/22 | 13.271 |
| 1/3/22 | 13.131 |
| 1/4/22 | 13.202 |
| 1/4/22 | 13.407 |
| 1/5/22 | 13.44 |
| 1/5/22 | 13.666 |
| 1/6/22 | 13.685 |
| 1/6/22 | 13.818 |
| 1/7/22 | 13.823 |
| 1/10/22 | 13.864 |
| 1/10/22 | 13.775 |
| 1/11/22 | 13.815 |
| 1/11/22 | 13.797 |
| 1/12/22 | 13.837 |
| 1/12/22 | 13.284 |
| 1/13/22 | 13.251 |
| 1/13/22 | 13.56 |
| 1/14/22 | 13.591 |
| 1/17/22 | 13.542 |
| 1/17/22 | 13.423 |
| 1/18/22 | 13.429 |
| 1/18/22 | 13.525 |
| 1/19/22 | 13.568 |
| 1/19/22 | 13.375 |
| 1/20/22 | 13.372 |
| 1/20/22 | 13.37 |
| 1/21/22 | 13.37 |
| 1/24/22 | 13.469 |
| 1/24/22 | 13.436 |
| 1/25/22 | 13.45 |
| 1/25/22 | 13.438 |
| 1/26/22 | 13.482 |
| 1/26/22 | 13.558 |
| 1/27/22 | 13.577 |
| 1/27/22 | 13.625 |
| 1/28/22 | 13.65 |
| 1/31/22 | 13.535 |
| 1/31/22 | 13.307 |
| 2/1/22 | 13.311 |
| 2/1/22 | 13.358 |
| 2/2/22 | 13.374 |
| 2/2/22 | 13.459 |
| 2/3/22 | 13.456 |
| 2/3/22 | 13.555 |
| 2/4/22 | 13.558 |
| 2/7/22 | 13.577 |
| 2/7/22 | 13.565 |
| 2/8/22 | 13.579 |
| 2/8/22 | 13.538 |
| 2/9/22 | 13.572 |
| 2/9/22 | 13.514 |
| 2/10/22 | 13.561 |
| 2/10/22 | 13.475 |
| 2/11/22 | 13.472 |
| 2/14/22 | 13.516 |
| 2/14/22 | 13.56 |
| 2/15/22 | 13.598 |
| 2/15/22 | 13.596 |
| 2/16/22 | 13.594 |
| 2/16/22 | 13.57 |
| 2/17/22 | 13.6 |
| 2/17/22 | 13.575 |
| 2/18/22 | 13.585 |
| 2/21/22 | 13.649 |
| 2/21/22 | 13.684 |
| 2/22/22 | 13.69 |
| 2/22/22 | 13.771 |
| 2/23/22 | 13.803 |
| 2/23/22 | 13.785 |
| 2/24/22 | 13.849 |
| 2/24/22 | 13.994 |
| 2/25/22 | 13.998 |
| 2/28/22 | 13.823 |
| 2/28/22 | 13.838 |
| 3/1/22 | 13.641 |
| 3/1/22 | 13.917 |
| 3/2/22 | 13.926 |
| 3/2/22 | 14.006 |
| 3/3/22 | 14.028 |
| 3/3/22 | 14.092 |
| 3/4/22 | 14.098 |
| 3/7/22 | 14.015 |
| 3/7/22 | 14.36 |
| 3/8/22 | 14.389 |
| 3/8/22 | 14.474 |
| 3/9/22 | 14.499 |
| 3/9/22 | 14.631 |
| 3/10/22 | 14.674 |
| 3/10/22 | 14.836 |
| 3/11/22 | 14.815 |
| 3/14/22 | 14.738 |
| 3/14/22 | 14.798 |
| 3/15/22 | 14.78 |
| 3/15/22 | 14.703 |
| 3/16/22 | 14.692 |
| 3/16/22 | 14.595 |
| 3/17/22 | 14.605 |
| 3/17/22 | 14.688 |
| 3/18/22 | 14.708 |
| 3/21/22 | 14.801 |
| 3/21/22 | 14.799 |
| 3/22/22 | 14.826 |
| 3/22/22 | 14.812 |
| 3/23/22 | 14.825 |
| 3/23/22 | 14.817 |
| 3/24/22 | 14.846 |
| 3/24/22 | 14.82 |
| 3/25/22 | 14.827 |
| 3/28/22 | 14.844 |
| 3/28/22 | 14.818 |
| 3/29/22 | 14.822 |
| 3/29/22 | 14.573 |
| 3/30/22 | 14.575 |
| 3/30/22 | 14.632 |
| 3/31/22 | 14.65 |
| 3/31/22 | 14.668 |
| 4/1/22 | 14.675 |
| 4/4/22 | 14.687 |
| 4/4/22 | 14.68 |
| 4/5/22 | 14.682 |
| 4/5/22 | 14.721 |
| 4/6/22 | 14.723 |
| 4/6/22 | 14.706 |
| 4/7/22 | 14.708 |
| 4/7/22 | 14.73 |
| 4/8/22 | 14.738 |
| 4/11/22 | 14.739 |
| 4/11/22 | 14.666 |
| 4/12/22 | 14.661 |
| 4/12/22 | 14.573 |
| 4/13/22 | 14.603 |
| 4/13/22 | 14.586 |
| 4/14/22 | 14.608 |
| 4/14/22 | 14.597 |
| 4/15/22 | 14.605 |
| 4/18/22 | 14.635 |
| 4/18/22 | 14.637 |
| 4/19/22 | 14.648 |
| 4/19/22 | 14.642 |
| 4/20/22 | 14.645 |
| 4/20/22 | 14.661 |
| 4/21/22 | 14.678 |
| 4/21/22 | 14.686 |
| 4/22/22 | 14.71 |
| 4/25/22 | 14.742 |
| 4/25/22 | 14.773 |
| 4/26/22 | 14.773 |
| 4/26/22 | 14.797 |
| 4/27/22 | 14.809 |
| 4/27/22 | 14.776 |
| 4/28/22 | 14.807 |
| 4/28/22 | 14.794 |
| 4/29/22 | 14.793 |
| 5/2/22 | 14.85 |
| 5/2/22 | 14.861 |
| 5/3/22 | 14.883 |
| 5/3/22 | 14.791 |
| 5/4/22 | 14.822 |
| 5/4/22 | 14.722 |
| 5/5/22 | 14.737 |
| 5/5/22 | 14.859 |
| 5/6/22 | 14.853 |
| 5/9/22 | 14.941 |
| 5/9/22 | 15.087 |
| 5/10/22 | 15.094 |
| 5/10/22 | 15.293 |
| 5/11/22 | 15.269 |
| 5/11/22 | 15.308 |
| 5/12/22 | 15.315 |
| 5/12/22 | 15.4 |
| 5/13/22 | 15.361 |
| 5/16/22 | 15.484 |
| 5/16/22 | 15.565 |
| 5/17/22 | 15.543 |
| 5/17/22 | 15.849 |
| 5/18/22 | 15.918 |
| 5/18/22 | 15.937 |
| 5/19/22 | 15.967 |
| 5/19/22 | 15.874 |
| 5/20/22 | 15.886 |
| 5/23/22 | 15.908 |
| 5/23/22 | 15.907 |
| 5/24/22 | 15.926 |
| 5/24/22 | 16.068 |
| 5/25/22 | 16.074 |
| 5/25/22 | 16.319 |
| 5/26/22 | 16.353 |
| 5/26/22 | 16.336 |
| 5/27/22 | 16.378 |
| 5/30/22 | 16.218 |
| 5/30/22 | 16.382 |
| 5/31/22 | 16.408 |
| 5/31/22 | 16.385 |
| 6/1/22 | 16.415 |
| 6/1/22 | 16.393 |
| 6/2/22 | 16.396 |
| 6/2/22 | 16.468 |
| 6/3/22 | 16.295 |
| 6/6/22 | 16.423 |
| 6/6/22 | 16.59 |
| 6/7/22 | 16.586 |
| 6/7/22 | 16.831 |
| 6/8/22 | 16.761 |
| 6/8/22 | 17.168 |
| 6/9/22 | 17.127 |
| 6/9/22 | 17.227 |
| 6/10/22 | 17.235 |
| 6/13/22 | 17.121 |
| 6/13/22 | 17.26 |
| 6/14/22 | 17.259 |
| 6/14/22 | 17.22 |
| 6/15/22 | 17.278 |
| 6/15/22 | 17.24 |
| 6/16/22 | 17.223 |
| 6/16/22 | 17.289 |
| 6/17/22 | 17.303 |
| 6/20/22 | 17.324 |
| 6/20/22 | 17.29 |
| 6/21/22 | 17.324 |
| 6/21/22 | 17.312 |
| 6/22/22 | 17.338 |
| 6/22/22 | 17.312 |
| 6/23/22 | 17.332 |
| 6/23/22 | 17.338 |
| 6/24/22 | 17.356 |
| 6/27/22 | 16.895 |
| 6/27/22 | 16.552 |
| 6/28/22 | 16.557 |
| 6/28/22 | 16.594 |
| 6/29/22 | 16.672 |
| 6/29/22 | 16.642 |
| 6/30/22 | 16.644 |
| 6/30/22 | 16.668 |
| 7/1/22 | 16.695 |
| 7/4/22 | 16.778 |
| 7/4/22 | 16.812 |
| 7/5/22 | 16.834 |
| 7/5/22 | 16.979 |
| 7/6/22 | 16.977 |
| 7/6/22 | 17.201 |
| 7/7/22 | 17.206 |
| 7/7/22 | 17.223 |
| 7/8/22 | 17.271 |
| 7/11/22 | 17.288 |
| 7/11/22 | 17.36 |
| 7/12/22 | 17.367 |
| 7/12/22 | 17.277 |
| 7/13/22 | 17.332 |
| 7/13/22 | 17.431 |
| 7/14/22 | 17.467 |
| 7/14/22 | 17.434 |
| 7/15/22 | 17.425 |
| 7/18/22 | 17.379 |
| 7/18/22 | 17.438 |
| 7/19/22 | 17.433 |
| 7/19/22 | 17.54 |
| 7/20/22 | 17.412 |
| 7/20/22 | 17.576 |
| 7/21/22 | 17.61 |
| 7/21/22 | 17.704 |
| 7/22/22 | 17.732 |
| 7/25/22 | 17.77 |
| 7/25/22 | 17.796 |
| 7/26/22 | 17.781 |
| 7/26/22 | 17.839 |
| 7/27/22 | 17.882 |
| 7/27/22 | 17.857 |
| 7/28/22 | 17.891 |
| 7/28/22 | 17.929 |
| 7/29/22 | 17.909 |
| 8/1/22 | 17.906 |
| 8/1/22 | 17.907 |
| 8/2/22 | 17.919 |
| 8/2/22 | 17.933 |
| 8/3/22 | 17.943 |
| 8/3/22 | 17.914 |
| 8/4/22 | 17.944 |
| 8/4/22 | 17.894 |
| 8/5/22 | 17.923 |
| 8/8/22 | 17.932 |
| 8/8/22 | 17.941 |
| 8/9/22 | 17.941 |
| 8/9/22 | 17.894 |
| 8/10/22 | 17.902 |
| 8/10/22 | 17.847 |
| 8/11/22 | 17.878 |
| 8/11/22 | 17.937 |
| 8/12/22 | 17.937 |
| 8/15/22 | 17.937 |
| 8/15/22 | 17.948 |
| 8/16/22 | 17.972 |
| 8/16/22 | 17.904 |
| 8/17/22 | 17.922 |
| 8/17/22 | 17.934 |
| 8/18/22 | 17.961 |
| 8/18/22 | 18.059 |
| 8/19/22 | 18.006 |
| 8/22/22 | 18.101 |
| 8/22/22 | 18.028 |
| 8/23/22 | 18.069 |
| 8/23/22 | 18.076 |
| 8/24/22 | 18.122 |
| 8/24/22 | 18.139 |
| 8/25/22 | 18.15 |
| 8/25/22 | 18.142 |
| 8/26/22 | 18.186 |
| 8/29/22 | 18.165 |
| 8/29/22 | 18.173 |
| 8/30/22 | 18.195 |
| 8/30/22 | 18.152 |
| 8/31/22 | 18.176 |
| 8/31/22 | 18.18 |
| 9/1/22 | 18.198 |
| 9/1/22 | 18.198 |
| 9/2/22 | 18.223 |
| 9/5/22 | 18.2 |
| 9/5/22 | 18.204 |
| 9/6/22 | 18.221 |
| 9/6/22 | 18.217 |
| 9/7/22 | 18.224 |
| 9/7/22 | 18.22 |
| 9/8/22 | 18.222 |
| 9/8/22 | 18.226 |
| 9/9/22 | 18.232 |
| 9/12/22 | 18.228 |
| 9/12/22 | 18.224 |
| 9/13/22 | 18.222 |
| 9/13/22 | 18.251 |
| 9/14/22 | 18.249 |
| 9/14/22 | 18.228 |
| 9/15/22 | 18.235 |
| 9/15/22 | 18.24 |
| 9/16/22 | 18.266 |
| 9/19/22 | 18.256 |
| 9/19/22 | 18.292 |
| 9/20/22 | 18.277 |
| 9/20/22 | 18.296 |
| 9/21/22 | 18.306 |
| 9/21/22 | 18.315 |
| 9/22/22 | 18.344 |
| 9/22/22 | 18.313 |
| 9/23/22 | 18.318 |
| 9/26/22 | 18.424 |
| 9/26/22 | 18.448 |
| 9/27/22 | 18.437 |
| 9/27/22 | 18.43 |
| 9/28/22 | 18.398 |
| 9/28/22 | 18.468 |
| 9/29/22 | 18.509 |
| 9/29/22 | 18.494 |
| 9/30/22 | 18.499 |
| 10/3/22 | 18.486 |
| 10/3/22 | 18.522 |
| 10/4/22 | 18.556 |
| 10/4/22 | 18.536 |
| 10/5/22 | 18.738 |
| 10/5/22 | 18.557 |
| 10/6/22 | 18.568 |
| 10/6/22 | 18.58 |
| 10/7/22 | 18.592 |
| 10/10/22 | 18.566 |
| 10/10/22 | 18.549 |
| 10/11/22 | 18.578 |
| 10/11/22 | 18.58 |
| 10/12/22 | 18.601 |
| 10/12/22 | 18.505 |
| 10/13/22 | 18.597 |
| 10/13/22 | 18.529 |
| 10/14/22 | 18.568 |
| 10/17/22 | 18.591 |
| 10/17/22 | 18.607 |
| 10/18/22 | 18.568 |
| 10/18/22 | 18.582 |
| 10/19/22 | 18.585 |
| 10/19/22 | 18.574 |
| 10/20/22 | 18.595 |
| 10/20/22 | 18.579 |
| 10/21/22 | 18.594 |
| 10/24/22 | 18.594 |
| 10/24/22 | 18.549 |
| 10/25/22 | 18.618 |
| 10/25/22 | 18.59 |
| 10/26/22 | 18.616 |
| 10/26/22 | 18.604 |
| 10/27/22 | 18.602 |
| 10/27/22 | 18.586 |
| 10/28/22 | 18.6 |
| 10/31/22 | 18.612 |
| 10/31/22 | 18.601 |
| 11/1/22 | 18.609 |
| 11/1/22 | 18.555 |
| 11/2/22 | 18.572 |
| 11/2/22 | 18.584 |
| 11/3/22 | 18.623 |
| 11/3/22 | 18.593 |
| 11/4/22 | 18.617 |
| 11/7/22 | 18.568 |
| 11/7/22 | 18.437 |
| 11/8/22 | 18.451 |
| 11/8/22 | 18.519 |
| 11/9/22 | 18.534 |
| 11/9/22 | 18.568 |
| 11/10/22 | 18.583 |
| 11/10/22 | 18.459 |
| 11/11/22 | 18.491 |
| 11/14/22 | 18.592 |
| 11/14/22 | 18.585 |
| 11/15/22 | 18.592 |
| 11/15/22 | 18.588 |
| 11/16/22 | 18.619 |
| 11/16/22 | 18.592 |
| 11/17/22 | 18.62 |
| 11/17/22 | 18.544 |
| 11/18/22 | 18.586 |
| 11/21/22 | 18.627 |
| 11/21/22 | 18.607 |
| 11/22/22 | 18.615 |
| 11/22/22 | 18.608 |
| 11/23/22 | 18.621 |
| 11/23/22 | 18.606 |
| 11/24/22 | 18.618 |
| 11/24/22 | 18.58 |
| 11/25/22 | 18.609 |
| 11/28/22 | 18.602 |
| 11/28/22 | 18.6 |
| 11/29/22 | 18.618 |
| 11/29/22 | 18.657 |
| 11/30/22 | 18.656 |
| 11/30/22 | 18.61 |
| 12/1/22 | 18.596 |
| 12/1/22 | 18.628 |
| 12/2/22 | 18.634 |
| 12/5/22 | 18.65 |
| 12/5/22 | 18.635 |
| 12/6/22 | 18.627 |
| 12/6/22 | 18.617 |
| 12/7/22 | 18.629 |
| 12/7/22 | 18.62 |
| 12/8/22 | 18.647 |
| 12/8/22 | 18.611 |
| 12/9/22 | 18.641 |
| 12/12/22 | 18.65 |
| 12/12/22 | 18.624 |
| 12/13/22 | 18.792 |
| 12/13/22 | 18.597 |
| 12/14/22 | 18.62 |
| 12/14/22 | 18.595 |
| 12/15/22 | 18.63 |
| 12/15/22 | 18.626 |
| 12/16/22 | 18.627 |
| 12/19/22 | 18.478 |
| 12/19/22 | 18.635 |
| 12/20/22 | 18.656 |
| 12/20/22 | 18.648 |
| 12/21/22 | 18.65 |
| 12/21/22 | 18.622 |
| 12/22/22 | 18.505 |
| 12/22/22 | 18.642 |
| 12/23/22 | 18.644 |
| 12/26/22 | 18.683 |
| 12/26/22 | 18.66 |
| 12/27/22 | 18.695 |
| 12/27/22 | 18.667 |
| 12/28/22 | 18.669 |
| 12/28/22 | 18.701 |
| 12/29/22 | 18.732 |
| 12/29/22 | 18.703 |
| 12/30/22 | 18.696 |
| 1/2/23 | 18.696 |
| 1/2/23 | 18.694 |
| 1/3/23 | 18.73 |
| 1/3/23 | 18.715 |
| 1/4/23 | 18.714 |
| 1/4/23 | 18.722 |
| 1/5/23 | 18.744 |
| 1/5/23 | 18.718 |
| 1/6/23 | 18.762 |
| 1/9/23 | 18.74 |
| 1/9/23 | 18.765 |
| 1/10/23 | 18.773 |
| 1/10/23 | 18.764 |
| 1/11/23 | 18.778 |
| 1/11/23 | 18.781 |
| 1/12/23 | 18.785 |
| 1/12/23 | 18.759 |
| 1/13/23 | 18.79 |
| 1/16/23 | 18.802 |
| 1/16/23 | 18.777 |
| 1/17/23 | 18.828 |
| 1/17/23 | 18.744 |
| 1/18/23 | 18.75 |
| 1/18/23 | 18.757 |
| 1/19/23 | 18.759 |
| 1/19/23 | 18.751 |
| 1/20/23 | 18.762 |
| 1/23/23 | 18.764 |
| 1/23/23 | 18.803 |
| 1/24/23 | 18.806 |
| 1/24/23 | 18.81 |
| 1/25/23 | 18.819 |
| 1/25/23 | 18.79 |
| 1/26/23 | 18.8 |
| 1/26/23 | 18.774 |
| 1/27/23 | 18.799 |
| 1/30/23 | 18.814 |
| 1/30/23 | 18.772 |
| 1/31/23 | 18.793 |
| 1/31/23 | 18.778 |
| 2/1/23 | 18.815 |
| 2/1/23 | 18.796 |
| 2/2/23 | 18.816 |
| 2/2/23 | 18.803 |
| 2/3/23 | 18.794 |
| 2/6/23 | 18.828 |
| 2/6/23 | 18.766 |
| 2/7/23 | 18.828 |
| 2/7/23 | 18.815 |
| 2/8/23 | 18.825 |
| 2/8/23 | 18.824 |
| 2/9/23 | 18.833 |
| 2/9/23 | 18.82 |
| 2/10/23 | 18.832 |
| 2/13/23 | 18.821 |
| 2/13/23 | 18.82 |
| 2/14/23 | 18.842 |
| 2/14/23 | 18.829 |
| 2/15/23 | 18.85 |
| 2/15/23 | 18.853 |
| 2/16/23 | 18.845 |
| 2/16/23 | 18.846 |
| 2/17/23 | 18.848 |
| 2/20/23 | 18.856 |
| 2/20/23 | 18.856 |
| 2/21/23 | 18.883 |
| 2/22/23 | 18.866 |
| 2/23/23 | 18.88 |
| 2/24/23 | 18.885 |
| 2/27/23 | 18.887 |
| 2/28/23 | 18.889 |
| 3/1/23 | 18.887 |
| 3/2/23 | 18.888 |
| 3/3/23 | 18.895 |
| 3/6/23 | 18.902 |
| 3/7/23 | 18.922 |
| 3/8/23 | 18.926 |
| 3/9/23 | 18.948 |
| 3/10/23 | 18.97 |
| 3/13/23 | 18.975 |
| 3/14/23 | 18.974 |
| 3/15/23 | 18.979 |
| 3/16/23 | 18.992 |
| 3/17/23 | 19.009 |
| 3/20/23 | 19.018 |
| 3/21/23 | 19.018 |
| 3/22/23 | 19.029 |
| 3/23/23 | 19.05 |
| 3/24/23 | 19.061 |
| 3/27/23 | 19.085 |
| 3/28/23 | 19.096 |
| 3/29/23 | 19.125 |
| 3/30/23 | 19.152 |
| 3/31/23 | 19.188 |
| 4/3/23 | 19.199 |
| 4/4/23 | 19.212 |
| 4/5/23 | 19.225 |
| 4/6/23 | 19.254 |
| 4/7/23 | 19.258 |
| 4/10/23 | 19.258 |
| 4/11/23 | 19.269 |
| 4/12/23 | 19.304 |
| 4/13/23 | 19.321 |
| 4/14/23 | 19.335 |
| 4/17/23 | 19.377 |
| 4/18/23 | 19.392 |
| 4/19/23 | 19.4 |
| 4/20/23 | 19.404 |
| 4/21/23 | 19.407 |
| 4/24/23 | 19.407 |
| 4/25/23 | 19.408 |
| 4/26/23 | 19.428 |
| 4/27/23 | 19.428 |
| 4/28/23 | 19.44 |
| 5/1/23 | 19.453 |
| 5/2/23 | 19.462 |
| 5/3/23 | 19.479 |
| 5/4/23 | 19.479 |
| 5/5/23 | 19.487 |
| 5/8/23 | 19.502 |
| 5/9/23 | 19.506 |
| 5/10/23 | 19.526 |
| 5/11/23 | 19.545 |
| 5/12/23 | 19.572 |
| 5/15/23 | 19.634 |
| 5/16/23 | 19.683 |
| 5/17/23 | 19.736 |
| 5/18/23 | 19.776 |
| 5/19/23 | 19.815 |
| 5/22/23 | 19.822 |
| 5/23/23 | 19.865 |
| 5/24/23 | 19.868 |
| 5/25/23 | 19.911 |
| 5/26/23 | 19.979 |
| 5/29/23 | 19.994 |
| 5/30/23 | 20.149 |
| 5/31/23 | 20.624 |
| 6/1/23 | 20.759 |
| 6/2/23 | 20.896 |
| 6/5/23 | 21.086 |
| 6/6/23 | 21.273 |
| 6/7/23 | 21.946 |
| 6/8/23 | 23.3 |
| 6/9/23 | 23.504 |
| 6/12/23 | 23.65 |
| 6/13/23 | 23.666 |
| 6/14/23 | 23.641 |
| 6/15/23 | 23.562 |
| 6/16/23 | 23.655 |
| 6/19/23 | 23.626 |
| 6/20/23 | 23.584 |
| 6/21/23 | 23.584 |
| 6/22/23 | 23.558 |
| 6/23/23 | 24.906 |
| 6/26/23 | 25.324 |
| 6/27/23 | 26.077 |
| 6/28/23 | 26.069 |
| 6/29/23 | 26.05 |
| 6/30/23 | 26.036 |
| 7/3/23 | 25.746 |
| 7/4/23 | 25.922 |
| 7/5/23 | 25.964 |
| 7/6/23 | 26.164 |
| 7/7/23 | 26.135 |
| 7/10/23 | 26.142 |
| 7/11/23 | 26.203 |
| 7/12/23 | 26.112 |
| 7/13/23 | 26.15 |
| 7/14/23 | 26.072 |
| 7/17/23 | 26.223 |
| 7/18/23 | 26.365 |
| 7/19/23 | 26.938 |
| 7/20/23 | 26.832 |
| 7/21/23 | 26.833 |
| 7/24/23 | 26.973 |
| 7/25/23 | 26.981 |
| 7/26/23 | 26.93 |
| 7/27/23 | 26.912 |
| 7/28/23 | 26.96 |
| 7/31/23 | 26.923 |
| 8/1/23 | 26.939 |
| 8/2/23 | 26.976 |
| 8/3/23 | 26.966 |
| 8/4/23 | 27.252 |
| 8/7/23 | 27.004 |
| 8/8/23 | 27.01 |
| 8/9/23 | 26.996 |
| 8/10/23 | 26.995 |
| 8/11/23 | 27.123 |
| 8/14/23 | 27.116 |
| 8/15/23 | 27.061 |
| 8/16/23 | 27.065 |
| 8/17/23 | 27.083 |
| 8/18/23 | 27.13 |
| 8/21/23 | 27.054 |
| 8/22/23 | 27.156 |
| 8/23/23 | 27.197 |
| 8/24/23 | 27.187 |
| 8/25/23 | 25.653 |
| 8/28/23 | 26.357 |
| 8/29/23 | 26.317 |
| 8/30/23 | 26.558 |
| 8/31/23 | 26.683 |
| 9/1/23 | 26.694 |
| 9/4/23 | 26.584 |
| 9/5/23 | 26.777 |
| 9/6/23 | 26.776 |
| 9/7/23 | 26.826 |
| 9/8/23 | 26.841 |
| 9/11/23 | 26.803 |
| 9/12/23 | 26.884 |
| 9/13/23 | 26.923 |
| 9/14/23 | 26.89 |
| 9/15/23 | 26.949 |
| 9/18/23 | 26.942 |
| 9/19/23 | 26.991 |
| 9/20/23 | 27.027 |
| 9/21/23 | 27.049 |
| 9/22/23 | 27.119 |
| 9/25/23 | 27.194 |
| 9/26/23 | 27.222 |
| 9/27/23 | 27.348 |
| 9/28/23 | 27.34 |
| 9/29/23 | 27.463 |
| 10/2/23 | 27.471 |
| 10/3/23 | 27.469 |
| 10/4/23 | 27.546 |
| 10/5/23 | 27.56 |
| 10/6/23 | 27.588 |
| 10/9/23 | 27.688 |
| 10/10/23 | 27.726 |
| 10/11/23 | 27.734 |
| 10/12/23 | 27.724 |
| 10/13/23 | 27.86 |
| 10/16/23 | 27.712 |
| 10/17/23 | 27.869 |
| 10/18/23 | 27.966 |
| 10/19/23 | 28.045 |
| 10/20/23 | 28.03 |
| 10/23/23 | 28.049 |
| 10/24/23 | 28.088 |
| 10/25/23 | 28.131 |
| 10/26/23 | 28.153 |
| 10/27/23 | 28.173 |
| 10/30/23 | 28.232 |
| 10/31/23 | 28.268 |
| 11/1/23 | 28.307 |
| 11/2/23 | 28.327 |
| 11/3/23 | 28.427 |
| 11/6/23 | 28.419 |
| 11/7/23 | 28.452 |
| 11/8/23 | 28.501 |
| 11/9/23 | 28.522 |
| 11/10/23 | 28.532 |
| 11/13/23 | 28.556 |
| 11/14/23 | 28.611 |
| 11/15/23 | 28.64 |
| 11/16/23 | 28.684 |